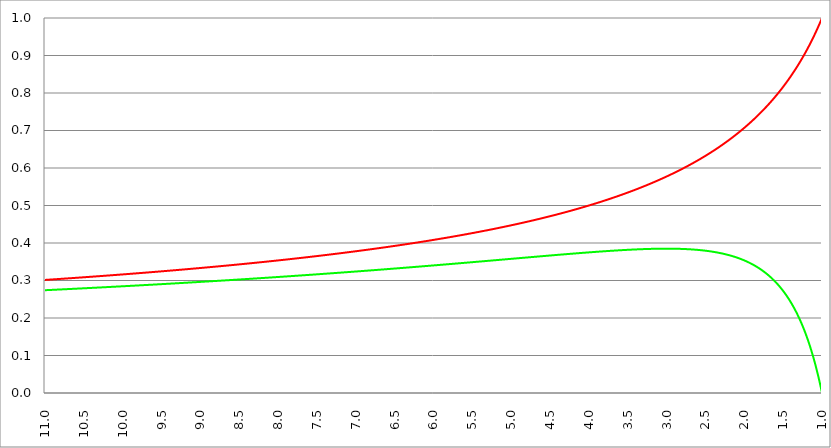
| Category | Series 1 | Series 0 | Series 2 |
|---|---|---|---|
| 11.0 | 0.302 | 0.274 |  |
| 10.995 | 0.302 | 0.274 |  |
| 10.99 | 0.302 | 0.274 |  |
| 10.985 | 0.302 | 0.274 |  |
| 10.98 | 0.302 | 0.274 |  |
| 10.975 | 0.302 | 0.274 |  |
| 10.97 | 0.302 | 0.274 |  |
| 10.96499999999999 | 0.302 | 0.274 |  |
| 10.96 | 0.302 | 0.275 |  |
| 10.955 | 0.302 | 0.275 |  |
| 10.95 | 0.302 | 0.275 |  |
| 10.945 | 0.302 | 0.275 |  |
| 10.94 | 0.302 | 0.275 |  |
| 10.93499999999999 | 0.302 | 0.275 |  |
| 10.92999999999999 | 0.302 | 0.275 |  |
| 10.92499999999999 | 0.303 | 0.275 |  |
| 10.91999999999999 | 0.303 | 0.275 |  |
| 10.91499999999999 | 0.303 | 0.275 |  |
| 10.90999999999999 | 0.303 | 0.275 |  |
| 10.90499999999999 | 0.303 | 0.275 |  |
| 10.89999999999998 | 0.303 | 0.275 |  |
| 10.89499999999998 | 0.303 | 0.275 |  |
| 10.88999999999998 | 0.303 | 0.275 |  |
| 10.88499999999998 | 0.303 | 0.275 |  |
| 10.87999999999998 | 0.303 | 0.275 |  |
| 10.87499999999998 | 0.303 | 0.275 |  |
| 10.86999999999998 | 0.303 | 0.275 |  |
| 10.86499999999998 | 0.303 | 0.275 |  |
| 10.85999999999998 | 0.303 | 0.276 |  |
| 10.85499999999998 | 0.304 | 0.276 |  |
| 10.84999999999998 | 0.304 | 0.276 |  |
| 10.84499999999998 | 0.304 | 0.276 |  |
| 10.83999999999997 | 0.304 | 0.276 |  |
| 10.83499999999997 | 0.304 | 0.276 |  |
| 10.82999999999997 | 0.304 | 0.276 |  |
| 10.82499999999997 | 0.304 | 0.276 |  |
| 10.81999999999997 | 0.304 | 0.276 |  |
| 10.81499999999997 | 0.304 | 0.276 |  |
| 10.80999999999997 | 0.304 | 0.276 |  |
| 10.80499999999997 | 0.304 | 0.276 |  |
| 10.79999999999997 | 0.304 | 0.276 |  |
| 10.79499999999997 | 0.304 | 0.276 |  |
| 10.78999999999997 | 0.304 | 0.276 |  |
| 10.78499999999997 | 0.305 | 0.276 |  |
| 10.77999999999997 | 0.305 | 0.276 |  |
| 10.77499999999996 | 0.305 | 0.276 |  |
| 10.76999999999996 | 0.305 | 0.276 |  |
| 10.76499999999996 | 0.305 | 0.276 |  |
| 10.75999999999996 | 0.305 | 0.277 |  |
| 10.75499999999996 | 0.305 | 0.277 |  |
| 10.74999999999996 | 0.305 | 0.277 |  |
| 10.74499999999996 | 0.305 | 0.277 |  |
| 10.73999999999996 | 0.305 | 0.277 |  |
| 10.73499999999996 | 0.305 | 0.277 |  |
| 10.72999999999996 | 0.305 | 0.277 |  |
| 10.72499999999996 | 0.305 | 0.277 |  |
| 10.71999999999996 | 0.305 | 0.277 |  |
| 10.71499999999996 | 0.305 | 0.277 |  |
| 10.70999999999995 | 0.306 | 0.277 |  |
| 10.70499999999995 | 0.306 | 0.277 |  |
| 10.69999999999995 | 0.306 | 0.277 |  |
| 10.69499999999995 | 0.306 | 0.277 |  |
| 10.68999999999995 | 0.306 | 0.277 |  |
| 10.68499999999995 | 0.306 | 0.277 |  |
| 10.67999999999995 | 0.306 | 0.277 |  |
| 10.67499999999995 | 0.306 | 0.277 |  |
| 10.66999999999995 | 0.306 | 0.277 |  |
| 10.66499999999995 | 0.306 | 0.277 |  |
| 10.65999999999995 | 0.306 | 0.278 |  |
| 10.65499999999995 | 0.306 | 0.278 |  |
| 10.64999999999995 | 0.306 | 0.278 |  |
| 10.64499999999994 | 0.306 | 0.278 |  |
| 10.63999999999994 | 0.307 | 0.278 |  |
| 10.63499999999994 | 0.307 | 0.278 |  |
| 10.62999999999994 | 0.307 | 0.278 |  |
| 10.62499999999994 | 0.307 | 0.278 |  |
| 10.61999999999994 | 0.307 | 0.278 |  |
| 10.61499999999994 | 0.307 | 0.278 |  |
| 10.60999999999994 | 0.307 | 0.278 |  |
| 10.60499999999994 | 0.307 | 0.278 |  |
| 10.59999999999994 | 0.307 | 0.278 |  |
| 10.59499999999994 | 0.307 | 0.278 |  |
| 10.58999999999994 | 0.307 | 0.278 |  |
| 10.58499999999994 | 0.307 | 0.278 |  |
| 10.57999999999993 | 0.307 | 0.278 |  |
| 10.57499999999993 | 0.308 | 0.278 |  |
| 10.56999999999993 | 0.308 | 0.278 |  |
| 10.56499999999993 | 0.308 | 0.279 |  |
| 10.55999999999993 | 0.308 | 0.279 |  |
| 10.55499999999993 | 0.308 | 0.279 |  |
| 10.54999999999993 | 0.308 | 0.279 |  |
| 10.54499999999993 | 0.308 | 0.279 |  |
| 10.53999999999993 | 0.308 | 0.279 |  |
| 10.53499999999993 | 0.308 | 0.279 |  |
| 10.52999999999993 | 0.308 | 0.279 |  |
| 10.52499999999993 | 0.308 | 0.279 |  |
| 10.51999999999992 | 0.308 | 0.279 |  |
| 10.51499999999992 | 0.308 | 0.279 |  |
| 10.50999999999992 | 0.308 | 0.279 |  |
| 10.50499999999992 | 0.309 | 0.279 |  |
| 10.49999999999992 | 0.309 | 0.279 |  |
| 10.49499999999992 | 0.309 | 0.279 |  |
| 10.48999999999992 | 0.309 | 0.279 |  |
| 10.48499999999992 | 0.309 | 0.279 |  |
| 10.47999999999992 | 0.309 | 0.279 |  |
| 10.47499999999992 | 0.309 | 0.279 |  |
| 10.46999999999992 | 0.309 | 0.28 |  |
| 10.46499999999992 | 0.309 | 0.28 |  |
| 10.45999999999992 | 0.309 | 0.28 |  |
| 10.45499999999991 | 0.309 | 0.28 |  |
| 10.44999999999991 | 0.309 | 0.28 |  |
| 10.44499999999991 | 0.309 | 0.28 |  |
| 10.43999999999991 | 0.309 | 0.28 |  |
| 10.43499999999991 | 0.31 | 0.28 |  |
| 10.42999999999991 | 0.31 | 0.28 |  |
| 10.42499999999991 | 0.31 | 0.28 |  |
| 10.41999999999991 | 0.31 | 0.28 |  |
| 10.41499999999991 | 0.31 | 0.28 |  |
| 10.40999999999991 | 0.31 | 0.28 |  |
| 10.40499999999991 | 0.31 | 0.28 |  |
| 10.39999999999991 | 0.31 | 0.28 |  |
| 10.39499999999991 | 0.31 | 0.28 |  |
| 10.3899999999999 | 0.31 | 0.28 |  |
| 10.3849999999999 | 0.31 | 0.28 |  |
| 10.3799999999999 | 0.31 | 0.28 |  |
| 10.3749999999999 | 0.31 | 0.281 |  |
| 10.3699999999999 | 0.311 | 0.281 |  |
| 10.3649999999999 | 0.311 | 0.281 |  |
| 10.3599999999999 | 0.311 | 0.281 |  |
| 10.3549999999999 | 0.311 | 0.281 |  |
| 10.3499999999999 | 0.311 | 0.281 |  |
| 10.3449999999999 | 0.311 | 0.281 |  |
| 10.3399999999999 | 0.311 | 0.281 |  |
| 10.3349999999999 | 0.311 | 0.281 |  |
| 10.3299999999999 | 0.311 | 0.281 |  |
| 10.32499999999989 | 0.311 | 0.281 |  |
| 10.31999999999989 | 0.311 | 0.281 |  |
| 10.31499999999989 | 0.311 | 0.281 |  |
| 10.3099999999999 | 0.311 | 0.281 |  |
| 10.3049999999999 | 0.312 | 0.281 |  |
| 10.2999999999999 | 0.312 | 0.281 |  |
| 10.29499999999989 | 0.312 | 0.281 |  |
| 10.28999999999989 | 0.312 | 0.281 |  |
| 10.28499999999989 | 0.312 | 0.281 |  |
| 10.27999999999989 | 0.312 | 0.282 |  |
| 10.27499999999989 | 0.312 | 0.282 |  |
| 10.26999999999989 | 0.312 | 0.282 |  |
| 10.26499999999989 | 0.312 | 0.282 |  |
| 10.25999999999988 | 0.312 | 0.282 |  |
| 10.25499999999988 | 0.312 | 0.282 |  |
| 10.24999999999988 | 0.312 | 0.282 |  |
| 10.24499999999988 | 0.312 | 0.282 |  |
| 10.23999999999988 | 0.313 | 0.282 |  |
| 10.23499999999988 | 0.313 | 0.282 |  |
| 10.22999999999988 | 0.313 | 0.282 |  |
| 10.22499999999988 | 0.313 | 0.282 |  |
| 10.21999999999988 | 0.313 | 0.282 |  |
| 10.21499999999988 | 0.313 | 0.282 |  |
| 10.20999999999988 | 0.313 | 0.282 |  |
| 10.20499999999988 | 0.313 | 0.282 |  |
| 10.19999999999987 | 0.313 | 0.282 |  |
| 10.19499999999987 | 0.313 | 0.282 |  |
| 10.18999999999987 | 0.313 | 0.283 |  |
| 10.18499999999987 | 0.313 | 0.283 |  |
| 10.17999999999987 | 0.313 | 0.283 |  |
| 10.17499999999987 | 0.313 | 0.283 |  |
| 10.16999999999987 | 0.314 | 0.283 |  |
| 10.16499999999987 | 0.314 | 0.283 |  |
| 10.15999999999987 | 0.314 | 0.283 |  |
| 10.15499999999987 | 0.314 | 0.283 |  |
| 10.14999999999987 | 0.314 | 0.283 |  |
| 10.14499999999987 | 0.314 | 0.283 |  |
| 10.13999999999987 | 0.314 | 0.283 |  |
| 10.13499999999986 | 0.314 | 0.283 |  |
| 10.12999999999986 | 0.314 | 0.283 |  |
| 10.12499999999986 | 0.314 | 0.283 |  |
| 10.11999999999986 | 0.314 | 0.283 |  |
| 10.11499999999986 | 0.314 | 0.283 |  |
| 10.10999999999986 | 0.315 | 0.283 |  |
| 10.10499999999986 | 0.315 | 0.283 |  |
| 10.09999999999986 | 0.315 | 0.284 |  |
| 10.09499999999986 | 0.315 | 0.284 |  |
| 10.08999999999986 | 0.315 | 0.284 |  |
| 10.08499999999986 | 0.315 | 0.284 |  |
| 10.07999999999986 | 0.315 | 0.284 |  |
| 10.07499999999986 | 0.315 | 0.284 |  |
| 10.06999999999985 | 0.315 | 0.284 |  |
| 10.06499999999985 | 0.315 | 0.284 |  |
| 10.05999999999985 | 0.315 | 0.284 |  |
| 10.05499999999985 | 0.315 | 0.284 |  |
| 10.04999999999985 | 0.315 | 0.284 |  |
| 10.04499999999985 | 0.316 | 0.284 |  |
| 10.03999999999985 | 0.316 | 0.284 |  |
| 10.03499999999985 | 0.316 | 0.284 |  |
| 10.02999999999985 | 0.316 | 0.284 |  |
| 10.02499999999985 | 0.316 | 0.284 |  |
| 10.01999999999985 | 0.316 | 0.284 |  |
| 10.01499999999985 | 0.316 | 0.284 |  |
| 10.00999999999985 | 0.316 | 0.284 |  |
| 10.00499999999984 | 0.316 | 0.285 |  |
| 9.999999999999844 | 0.316 | 0.285 |  |
| 9.994999999999841 | 0.316 | 0.285 |  |
| 9.98999999999984 | 0.316 | 0.285 |  |
| 9.98499999999984 | 0.316 | 0.285 |  |
| 9.97999999999984 | 0.317 | 0.285 |  |
| 9.97499999999984 | 0.317 | 0.285 |  |
| 9.969999999999837 | 0.317 | 0.285 |  |
| 9.964999999999838 | 0.317 | 0.285 |  |
| 9.959999999999837 | 0.317 | 0.285 |  |
| 9.954999999999837 | 0.317 | 0.285 |  |
| 9.949999999999836 | 0.317 | 0.285 |  |
| 9.944999999999835 | 0.317 | 0.285 |  |
| 9.939999999999834 | 0.317 | 0.285 |  |
| 9.934999999999834 | 0.317 | 0.285 |  |
| 9.929999999999833 | 0.317 | 0.285 |  |
| 9.92499999999983 | 0.317 | 0.285 |  |
| 9.91999999999983 | 0.318 | 0.285 |  |
| 9.91499999999983 | 0.318 | 0.286 |  |
| 9.90999999999983 | 0.318 | 0.286 |  |
| 9.904999999999829 | 0.318 | 0.286 |  |
| 9.899999999999826 | 0.318 | 0.286 |  |
| 9.894999999999827 | 0.318 | 0.286 |  |
| 9.889999999999826 | 0.318 | 0.286 |  |
| 9.884999999999826 | 0.318 | 0.286 |  |
| 9.879999999999823 | 0.318 | 0.286 |  |
| 9.874999999999824 | 0.318 | 0.286 |  |
| 9.869999999999823 | 0.318 | 0.286 |  |
| 9.864999999999823 | 0.318 | 0.286 |  |
| 9.85999999999982 | 0.318 | 0.286 |  |
| 9.85499999999982 | 0.319 | 0.286 |  |
| 9.84999999999982 | 0.319 | 0.286 |  |
| 9.84499999999982 | 0.319 | 0.286 |  |
| 9.839999999999819 | 0.319 | 0.286 |  |
| 9.834999999999818 | 0.319 | 0.286 |  |
| 9.829999999999817 | 0.319 | 0.287 |  |
| 9.824999999999816 | 0.319 | 0.287 |  |
| 9.819999999999816 | 0.319 | 0.287 |  |
| 9.814999999999815 | 0.319 | 0.287 |  |
| 9.809999999999812 | 0.319 | 0.287 |  |
| 9.804999999999813 | 0.319 | 0.287 |  |
| 9.799999999999812 | 0.319 | 0.287 |  |
| 9.794999999999812 | 0.32 | 0.287 |  |
| 9.78999999999981 | 0.32 | 0.287 |  |
| 9.78499999999981 | 0.32 | 0.287 |  |
| 9.77999999999981 | 0.32 | 0.287 |  |
| 9.774999999999809 | 0.32 | 0.287 |  |
| 9.769999999999808 | 0.32 | 0.287 |  |
| 9.764999999999807 | 0.32 | 0.287 |  |
| 9.759999999999806 | 0.32 | 0.287 |  |
| 9.754999999999805 | 0.32 | 0.287 |  |
| 9.749999999999805 | 0.32 | 0.287 |  |
| 9.744999999999804 | 0.32 | 0.287 |  |
| 9.739999999999803 | 0.32 | 0.288 |  |
| 9.734999999999802 | 0.321 | 0.288 |  |
| 9.729999999999801 | 0.321 | 0.288 |  |
| 9.7249999999998 | 0.321 | 0.288 |  |
| 9.7199999999998 | 0.321 | 0.288 |  |
| 9.7149999999998 | 0.321 | 0.288 |  |
| 9.709999999999798 | 0.321 | 0.288 |  |
| 9.704999999999798 | 0.321 | 0.288 |  |
| 9.699999999999797 | 0.321 | 0.288 |  |
| 9.694999999999794 | 0.321 | 0.288 |  |
| 9.689999999999795 | 0.321 | 0.288 |  |
| 9.684999999999794 | 0.321 | 0.288 |  |
| 9.679999999999794 | 0.321 | 0.288 |  |
| 9.674999999999793 | 0.321 | 0.288 |  |
| 9.66999999999979 | 0.322 | 0.288 |  |
| 9.66499999999979 | 0.322 | 0.288 |  |
| 9.65999999999979 | 0.322 | 0.288 |  |
| 9.65499999999979 | 0.322 | 0.288 |  |
| 9.649999999999787 | 0.322 | 0.289 |  |
| 9.644999999999788 | 0.322 | 0.289 |  |
| 9.639999999999787 | 0.322 | 0.289 |  |
| 9.634999999999787 | 0.322 | 0.289 |  |
| 9.629999999999786 | 0.322 | 0.289 |  |
| 9.624999999999785 | 0.322 | 0.289 |  |
| 9.619999999999784 | 0.322 | 0.289 |  |
| 9.614999999999783 | 0.322 | 0.289 |  |
| 9.609999999999783 | 0.323 | 0.289 |  |
| 9.60499999999978 | 0.323 | 0.289 |  |
| 9.59999999999978 | 0.323 | 0.289 |  |
| 9.59499999999978 | 0.323 | 0.289 |  |
| 9.58999999999978 | 0.323 | 0.289 |  |
| 9.584999999999779 | 0.323 | 0.289 |  |
| 9.579999999999778 | 0.323 | 0.289 |  |
| 9.574999999999777 | 0.323 | 0.289 |  |
| 9.569999999999776 | 0.323 | 0.289 |  |
| 9.564999999999776 | 0.323 | 0.29 |  |
| 9.559999999999773 | 0.323 | 0.29 |  |
| 9.554999999999774 | 0.324 | 0.29 |  |
| 9.549999999999773 | 0.324 | 0.29 |  |
| 9.544999999999773 | 0.324 | 0.29 |  |
| 9.539999999999772 | 0.324 | 0.29 |  |
| 9.534999999999771 | 0.324 | 0.29 |  |
| 9.52999999999977 | 0.324 | 0.29 |  |
| 9.52499999999977 | 0.324 | 0.29 |  |
| 9.519999999999769 | 0.324 | 0.29 |  |
| 9.514999999999768 | 0.324 | 0.29 |  |
| 9.509999999999767 | 0.324 | 0.29 |  |
| 9.504999999999766 | 0.324 | 0.29 |  |
| 9.499999999999766 | 0.324 | 0.29 |  |
| 9.494999999999765 | 0.325 | 0.29 |  |
| 9.489999999999762 | 0.325 | 0.29 |  |
| 9.484999999999763 | 0.325 | 0.29 |  |
| 9.47999999999976 | 0.325 | 0.291 |  |
| 9.47499999999976 | 0.325 | 0.291 |  |
| 9.46999999999976 | 0.325 | 0.291 |  |
| 9.46499999999976 | 0.325 | 0.291 |  |
| 9.45999999999976 | 0.325 | 0.291 |  |
| 9.454999999999758 | 0.325 | 0.291 |  |
| 9.449999999999758 | 0.325 | 0.291 |  |
| 9.444999999999757 | 0.325 | 0.291 |  |
| 9.439999999999756 | 0.325 | 0.291 |  |
| 9.434999999999755 | 0.326 | 0.291 |  |
| 9.429999999999755 | 0.326 | 0.291 |  |
| 9.424999999999754 | 0.326 | 0.291 |  |
| 9.419999999999751 | 0.326 | 0.291 |  |
| 9.414999999999752 | 0.326 | 0.291 |  |
| 9.40999999999975 | 0.326 | 0.291 |  |
| 9.40499999999975 | 0.326 | 0.291 |  |
| 9.39999999999975 | 0.326 | 0.291 |  |
| 9.39499999999975 | 0.326 | 0.292 |  |
| 9.389999999999748 | 0.326 | 0.292 |  |
| 9.384999999999748 | 0.326 | 0.292 |  |
| 9.379999999999747 | 0.327 | 0.292 |  |
| 9.374999999999744 | 0.327 | 0.292 |  |
| 9.369999999999745 | 0.327 | 0.292 |  |
| 9.364999999999744 | 0.327 | 0.292 |  |
| 9.35999999999974 | 0.327 | 0.292 |  |
| 9.35499999999974 | 0.327 | 0.292 |  |
| 9.34999999999974 | 0.327 | 0.292 |  |
| 9.34499999999974 | 0.327 | 0.292 |  |
| 9.33999999999974 | 0.327 | 0.292 |  |
| 9.33499999999974 | 0.327 | 0.292 |  |
| 9.329999999999737 | 0.327 | 0.292 |  |
| 9.324999999999738 | 0.327 | 0.292 |  |
| 9.319999999999737 | 0.328 | 0.292 |  |
| 9.314999999999737 | 0.328 | 0.292 |  |
| 9.309999999999736 | 0.328 | 0.293 |  |
| 9.304999999999733 | 0.328 | 0.293 |  |
| 9.299999999999734 | 0.328 | 0.293 |  |
| 9.294999999999733 | 0.328 | 0.293 |  |
| 9.289999999999733 | 0.328 | 0.293 |  |
| 9.28499999999973 | 0.328 | 0.293 |  |
| 9.27999999999973 | 0.328 | 0.293 |  |
| 9.27499999999973 | 0.328 | 0.293 |  |
| 9.26999999999973 | 0.328 | 0.293 |  |
| 9.264999999999729 | 0.329 | 0.293 |  |
| 9.259999999999726 | 0.329 | 0.293 |  |
| 9.254999999999727 | 0.329 | 0.293 |  |
| 9.249999999999726 | 0.329 | 0.293 |  |
| 9.244999999999726 | 0.329 | 0.293 |  |
| 9.239999999999725 | 0.329 | 0.293 |  |
| 9.234999999999724 | 0.329 | 0.293 |  |
| 9.229999999999723 | 0.329 | 0.293 |  |
| 9.224999999999723 | 0.329 | 0.294 |  |
| 9.219999999999722 | 0.329 | 0.294 |  |
| 9.214999999999721 | 0.329 | 0.294 |  |
| 9.20999999999972 | 0.33 | 0.294 |  |
| 9.20499999999972 | 0.33 | 0.294 |  |
| 9.199999999999719 | 0.33 | 0.294 |  |
| 9.194999999999718 | 0.33 | 0.294 |  |
| 9.189999999999717 | 0.33 | 0.294 |  |
| 9.184999999999716 | 0.33 | 0.294 |  |
| 9.179999999999715 | 0.33 | 0.294 |  |
| 9.174999999999715 | 0.33 | 0.294 |  |
| 9.169999999999712 | 0.33 | 0.294 |  |
| 9.164999999999713 | 0.33 | 0.294 |  |
| 9.15999999999971 | 0.33 | 0.294 |  |
| 9.15499999999971 | 0.33 | 0.294 |  |
| 9.14999999999971 | 0.331 | 0.294 |  |
| 9.14499999999971 | 0.331 | 0.295 |  |
| 9.13999999999971 | 0.331 | 0.295 |  |
| 9.134999999999708 | 0.331 | 0.295 |  |
| 9.129999999999708 | 0.331 | 0.295 |  |
| 9.124999999999707 | 0.331 | 0.295 |  |
| 9.119999999999706 | 0.331 | 0.295 |  |
| 9.114999999999705 | 0.331 | 0.295 |  |
| 9.109999999999705 | 0.331 | 0.295 |  |
| 9.104999999999704 | 0.331 | 0.295 |  |
| 9.099999999999701 | 0.331 | 0.295 |  |
| 9.094999999999702 | 0.332 | 0.295 |  |
| 9.0899999999997 | 0.332 | 0.295 |  |
| 9.0849999999997 | 0.332 | 0.295 |  |
| 9.0799999999997 | 0.332 | 0.295 |  |
| 9.0749999999997 | 0.332 | 0.295 |  |
| 9.069999999999698 | 0.332 | 0.295 |  |
| 9.064999999999698 | 0.332 | 0.295 |  |
| 9.059999999999697 | 0.332 | 0.296 |  |
| 9.054999999999694 | 0.332 | 0.296 |  |
| 9.049999999999695 | 0.332 | 0.296 |  |
| 9.044999999999694 | 0.333 | 0.296 |  |
| 9.039999999999694 | 0.333 | 0.296 |  |
| 9.034999999999693 | 0.333 | 0.296 |  |
| 9.02999999999969 | 0.333 | 0.296 |  |
| 9.02499999999969 | 0.333 | 0.296 |  |
| 9.01999999999969 | 0.333 | 0.296 |  |
| 9.01499999999969 | 0.333 | 0.296 |  |
| 9.009999999999687 | 0.333 | 0.296 |  |
| 9.004999999999688 | 0.333 | 0.296 |  |
| 8.999999999999687 | 0.333 | 0.296 |  |
| 8.994999999999687 | 0.333 | 0.296 |  |
| 8.989999999999686 | 0.334 | 0.296 |  |
| 8.984999999999683 | 0.334 | 0.296 |  |
| 8.979999999999684 | 0.334 | 0.297 |  |
| 8.974999999999683 | 0.334 | 0.297 |  |
| 8.96999999999968 | 0.334 | 0.297 |  |
| 8.96499999999968 | 0.334 | 0.297 |  |
| 8.95999999999968 | 0.334 | 0.297 |  |
| 8.95499999999968 | 0.334 | 0.297 |  |
| 8.94999999999968 | 0.334 | 0.297 |  |
| 8.944999999999679 | 0.334 | 0.297 |  |
| 8.939999999999676 | 0.334 | 0.297 |  |
| 8.934999999999677 | 0.335 | 0.297 |  |
| 8.929999999999676 | 0.335 | 0.297 |  |
| 8.924999999999676 | 0.335 | 0.297 |  |
| 8.919999999999675 | 0.335 | 0.297 |  |
| 8.914999999999674 | 0.335 | 0.297 |  |
| 8.909999999999673 | 0.335 | 0.297 |  |
| 8.904999999999673 | 0.335 | 0.297 |  |
| 8.89999999999967 | 0.335 | 0.298 |  |
| 8.89499999999967 | 0.335 | 0.298 |  |
| 8.88999999999967 | 0.335 | 0.298 |  |
| 8.88499999999967 | 0.335 | 0.298 |  |
| 8.879999999999669 | 0.336 | 0.298 |  |
| 8.874999999999668 | 0.336 | 0.298 |  |
| 8.869999999999665 | 0.336 | 0.298 |  |
| 8.864999999999666 | 0.336 | 0.298 |  |
| 8.859999999999665 | 0.336 | 0.298 |  |
| 8.854999999999665 | 0.336 | 0.298 |  |
| 8.849999999999662 | 0.336 | 0.298 |  |
| 8.844999999999663 | 0.336 | 0.298 |  |
| 8.83999999999966 | 0.336 | 0.298 |  |
| 8.83499999999966 | 0.336 | 0.298 |  |
| 8.82999999999966 | 0.337 | 0.298 |  |
| 8.82499999999966 | 0.337 | 0.298 |  |
| 8.81999999999966 | 0.337 | 0.299 |  |
| 8.814999999999658 | 0.337 | 0.299 |  |
| 8.809999999999658 | 0.337 | 0.299 |  |
| 8.804999999999657 | 0.337 | 0.299 |  |
| 8.799999999999656 | 0.337 | 0.299 |  |
| 8.794999999999655 | 0.337 | 0.299 |  |
| 8.789999999999655 | 0.337 | 0.299 |  |
| 8.784999999999654 | 0.337 | 0.299 |  |
| 8.779999999999651 | 0.337 | 0.299 |  |
| 8.774999999999652 | 0.338 | 0.299 |  |
| 8.76999999999965 | 0.338 | 0.299 |  |
| 8.76499999999965 | 0.338 | 0.299 |  |
| 8.75999999999965 | 0.338 | 0.299 |  |
| 8.754999999999647 | 0.338 | 0.299 |  |
| 8.749999999999648 | 0.338 | 0.299 |  |
| 8.744999999999647 | 0.338 | 0.299 |  |
| 8.739999999999647 | 0.338 | 0.3 |  |
| 8.734999999999644 | 0.338 | 0.3 |  |
| 8.729999999999645 | 0.338 | 0.3 |  |
| 8.724999999999644 | 0.339 | 0.3 |  |
| 8.719999999999644 | 0.339 | 0.3 |  |
| 8.714999999999643 | 0.339 | 0.3 |  |
| 8.70999999999964 | 0.339 | 0.3 |  |
| 8.70499999999964 | 0.339 | 0.3 |  |
| 8.69999999999964 | 0.339 | 0.3 |  |
| 8.69499999999964 | 0.339 | 0.3 |  |
| 8.689999999999637 | 0.339 | 0.3 |  |
| 8.684999999999638 | 0.339 | 0.3 |  |
| 8.679999999999637 | 0.339 | 0.3 |  |
| 8.674999999999637 | 0.34 | 0.3 |  |
| 8.669999999999636 | 0.34 | 0.3 |  |
| 8.664999999999633 | 0.34 | 0.301 |  |
| 8.659999999999634 | 0.34 | 0.301 |  |
| 8.654999999999633 | 0.34 | 0.301 |  |
| 8.649999999999633 | 0.34 | 0.301 |  |
| 8.644999999999632 | 0.34 | 0.301 |  |
| 8.63999999999963 | 0.34 | 0.301 |  |
| 8.63499999999963 | 0.34 | 0.301 |  |
| 8.62999999999963 | 0.34 | 0.301 |  |
| 8.624999999999629 | 0.341 | 0.301 |  |
| 8.619999999999626 | 0.341 | 0.301 |  |
| 8.614999999999627 | 0.341 | 0.301 |  |
| 8.609999999999626 | 0.341 | 0.301 |  |
| 8.604999999999626 | 0.341 | 0.301 |  |
| 8.599999999999625 | 0.341 | 0.301 |  |
| 8.594999999999624 | 0.341 | 0.301 |  |
| 8.589999999999623 | 0.341 | 0.301 |  |
| 8.584999999999622 | 0.341 | 0.302 |  |
| 8.57999999999962 | 0.341 | 0.302 |  |
| 8.57499999999962 | 0.341 | 0.302 |  |
| 8.56999999999962 | 0.342 | 0.302 |  |
| 8.56499999999962 | 0.342 | 0.302 |  |
| 8.559999999999619 | 0.342 | 0.302 |  |
| 8.554999999999618 | 0.342 | 0.302 |  |
| 8.549999999999617 | 0.342 | 0.302 |  |
| 8.544999999999616 | 0.342 | 0.302 |  |
| 8.539999999999615 | 0.342 | 0.302 |  |
| 8.534999999999615 | 0.342 | 0.302 |  |
| 8.529999999999612 | 0.342 | 0.302 |  |
| 8.524999999999613 | 0.342 | 0.302 |  |
| 8.51999999999961 | 0.343 | 0.302 |  |
| 8.51499999999961 | 0.343 | 0.302 |  |
| 8.50999999999961 | 0.343 | 0.303 |  |
| 8.50499999999961 | 0.343 | 0.303 |  |
| 8.49999999999961 | 0.343 | 0.303 |  |
| 8.494999999999608 | 0.343 | 0.303 |  |
| 8.489999999999608 | 0.343 | 0.303 |  |
| 8.484999999999607 | 0.343 | 0.303 |  |
| 8.479999999999606 | 0.343 | 0.303 |  |
| 8.474999999999605 | 0.344 | 0.303 |  |
| 8.469999999999605 | 0.344 | 0.303 |  |
| 8.464999999999604 | 0.344 | 0.303 |  |
| 8.4599999999996 | 0.344 | 0.303 |  |
| 8.4549999999996 | 0.344 | 0.303 |  |
| 8.4499999999996 | 0.344 | 0.303 |  |
| 8.4449999999996 | 0.344 | 0.303 |  |
| 8.4399999999996 | 0.344 | 0.303 |  |
| 8.4349999999996 | 0.344 | 0.303 |  |
| 8.429999999999598 | 0.344 | 0.304 |  |
| 8.424999999999597 | 0.345 | 0.304 |  |
| 8.419999999999597 | 0.345 | 0.304 |  |
| 8.414999999999594 | 0.345 | 0.304 |  |
| 8.409999999999595 | 0.345 | 0.304 |  |
| 8.404999999999594 | 0.345 | 0.304 |  |
| 8.399999999999594 | 0.345 | 0.304 |  |
| 8.394999999999593 | 0.345 | 0.304 |  |
| 8.38999999999959 | 0.345 | 0.304 |  |
| 8.38499999999959 | 0.345 | 0.304 |  |
| 8.37999999999959 | 0.345 | 0.304 |  |
| 8.37499999999959 | 0.346 | 0.304 |  |
| 8.369999999999589 | 0.346 | 0.304 |  |
| 8.364999999999588 | 0.346 | 0.304 |  |
| 8.359999999999587 | 0.346 | 0.304 |  |
| 8.354999999999587 | 0.346 | 0.305 |  |
| 8.349999999999586 | 0.346 | 0.305 |  |
| 8.344999999999585 | 0.346 | 0.305 |  |
| 8.339999999999584 | 0.346 | 0.305 |  |
| 8.334999999999583 | 0.346 | 0.305 |  |
| 8.329999999999583 | 0.346 | 0.305 |  |
| 8.324999999999582 | 0.347 | 0.305 |  |
| 8.31999999999958 | 0.347 | 0.305 |  |
| 8.31499999999958 | 0.347 | 0.305 |  |
| 8.30999999999958 | 0.347 | 0.305 |  |
| 8.304999999999579 | 0.347 | 0.305 |  |
| 8.299999999999578 | 0.347 | 0.305 |  |
| 8.294999999999577 | 0.347 | 0.305 |  |
| 8.289999999999576 | 0.347 | 0.305 |  |
| 8.284999999999576 | 0.347 | 0.305 |  |
| 8.279999999999575 | 0.348 | 0.306 |  |
| 8.274999999999574 | 0.348 | 0.306 |  |
| 8.269999999999573 | 0.348 | 0.306 |  |
| 8.264999999999572 | 0.348 | 0.306 |  |
| 8.259999999999572 | 0.348 | 0.306 |  |
| 8.254999999999571 | 0.348 | 0.306 |  |
| 8.24999999999957 | 0.348 | 0.306 |  |
| 8.24499999999957 | 0.348 | 0.306 |  |
| 8.239999999999569 | 0.348 | 0.306 |  |
| 8.234999999999568 | 0.348 | 0.306 |  |
| 8.229999999999567 | 0.349 | 0.306 |  |
| 8.224999999999566 | 0.349 | 0.306 |  |
| 8.219999999999565 | 0.349 | 0.306 |  |
| 8.214999999999565 | 0.349 | 0.306 |  |
| 8.209999999999564 | 0.349 | 0.306 |  |
| 8.204999999999563 | 0.349 | 0.307 |  |
| 8.199999999999562 | 0.349 | 0.307 |  |
| 8.194999999999562 | 0.349 | 0.307 |  |
| 8.18999999999956 | 0.349 | 0.307 |  |
| 8.18499999999956 | 0.35 | 0.307 |  |
| 8.17999999999956 | 0.35 | 0.307 |  |
| 8.174999999999558 | 0.35 | 0.307 |  |
| 8.169999999999558 | 0.35 | 0.307 |  |
| 8.164999999999557 | 0.35 | 0.307 |  |
| 8.159999999999556 | 0.35 | 0.307 |  |
| 8.154999999999555 | 0.35 | 0.307 |  |
| 8.149999999999554 | 0.35 | 0.307 |  |
| 8.144999999999554 | 0.35 | 0.307 |  |
| 8.139999999999553 | 0.35 | 0.307 |  |
| 8.134999999999552 | 0.351 | 0.308 |  |
| 8.129999999999551 | 0.351 | 0.308 |  |
| 8.12499999999955 | 0.351 | 0.308 |  |
| 8.11999999999955 | 0.351 | 0.308 |  |
| 8.11499999999955 | 0.351 | 0.308 |  |
| 8.109999999999548 | 0.351 | 0.308 |  |
| 8.104999999999547 | 0.351 | 0.308 |  |
| 8.099999999999547 | 0.351 | 0.308 |  |
| 8.094999999999544 | 0.351 | 0.308 |  |
| 8.089999999999545 | 0.352 | 0.308 |  |
| 8.084999999999544 | 0.352 | 0.308 |  |
| 8.079999999999544 | 0.352 | 0.308 |  |
| 8.074999999999543 | 0.352 | 0.308 |  |
| 8.06999999999954 | 0.352 | 0.308 |  |
| 8.06499999999954 | 0.352 | 0.308 |  |
| 8.05999999999954 | 0.352 | 0.309 |  |
| 8.05499999999954 | 0.352 | 0.309 |  |
| 8.049999999999539 | 0.352 | 0.309 |  |
| 8.044999999999538 | 0.353 | 0.309 |  |
| 8.039999999999537 | 0.353 | 0.309 |  |
| 8.034999999999537 | 0.353 | 0.309 |  |
| 8.029999999999536 | 0.353 | 0.309 |  |
| 8.024999999999535 | 0.353 | 0.309 |  |
| 8.019999999999534 | 0.353 | 0.309 |  |
| 8.014999999999533 | 0.353 | 0.309 |  |
| 8.009999999999533 | 0.353 | 0.309 |  |
| 8.004999999999532 | 0.353 | 0.309 |  |
| 7.999999999999531 | 0.354 | 0.309 |  |
| 7.994999999999532 | 0.354 | 0.309 |  |
| 7.989999999999532 | 0.354 | 0.309 |  |
| 7.984999999999532 | 0.354 | 0.31 |  |
| 7.979999999999532 | 0.354 | 0.31 |  |
| 7.974999999999532 | 0.354 | 0.31 |  |
| 7.969999999999532 | 0.354 | 0.31 |  |
| 7.964999999999533 | 0.354 | 0.31 |  |
| 7.959999999999532 | 0.354 | 0.31 |  |
| 7.954999999999533 | 0.355 | 0.31 |  |
| 7.949999999999532 | 0.355 | 0.31 |  |
| 7.944999999999533 | 0.355 | 0.31 |  |
| 7.939999999999533 | 0.355 | 0.31 |  |
| 7.934999999999533 | 0.355 | 0.31 |  |
| 7.929999999999533 | 0.355 | 0.31 |  |
| 7.924999999999534 | 0.355 | 0.31 |  |
| 7.919999999999533 | 0.355 | 0.31 |  |
| 7.914999999999534 | 0.355 | 0.311 |  |
| 7.909999999999533 | 0.356 | 0.311 |  |
| 7.904999999999534 | 0.356 | 0.311 |  |
| 7.899999999999534 | 0.356 | 0.311 |  |
| 7.894999999999534 | 0.356 | 0.311 |  |
| 7.889999999999534 | 0.356 | 0.311 |  |
| 7.884999999999534 | 0.356 | 0.311 |  |
| 7.879999999999534 | 0.356 | 0.311 |  |
| 7.874999999999534 | 0.356 | 0.311 |  |
| 7.869999999999534 | 0.356 | 0.311 |  |
| 7.864999999999535 | 0.357 | 0.311 |  |
| 7.859999999999534 | 0.357 | 0.311 |  |
| 7.854999999999535 | 0.357 | 0.311 |  |
| 7.849999999999535 | 0.357 | 0.311 |  |
| 7.844999999999535 | 0.357 | 0.312 |  |
| 7.839999999999535 | 0.357 | 0.312 |  |
| 7.834999999999535 | 0.357 | 0.312 |  |
| 7.829999999999535 | 0.357 | 0.312 |  |
| 7.824999999999536 | 0.357 | 0.312 |  |
| 7.819999999999535 | 0.358 | 0.312 |  |
| 7.814999999999536 | 0.358 | 0.312 |  |
| 7.809999999999535 | 0.358 | 0.312 |  |
| 7.804999999999536 | 0.358 | 0.312 |  |
| 7.799999999999536 | 0.358 | 0.312 |  |
| 7.794999999999536 | 0.358 | 0.312 |  |
| 7.789999999999536 | 0.358 | 0.312 |  |
| 7.784999999999536 | 0.358 | 0.312 |  |
| 7.779999999999536 | 0.359 | 0.312 |  |
| 7.774999999999536 | 0.359 | 0.313 |  |
| 7.769999999999536 | 0.359 | 0.313 |  |
| 7.764999999999537 | 0.359 | 0.313 |  |
| 7.759999999999536 | 0.359 | 0.313 |  |
| 7.754999999999537 | 0.359 | 0.313 |  |
| 7.749999999999537 | 0.359 | 0.313 |  |
| 7.744999999999537 | 0.359 | 0.313 |  |
| 7.739999999999537 | 0.359 | 0.313 |  |
| 7.734999999999537 | 0.36 | 0.313 |  |
| 7.729999999999537 | 0.36 | 0.313 |  |
| 7.724999999999538 | 0.36 | 0.313 |  |
| 7.719999999999537 | 0.36 | 0.313 |  |
| 7.714999999999538 | 0.36 | 0.313 |  |
| 7.709999999999538 | 0.36 | 0.313 |  |
| 7.704999999999538 | 0.36 | 0.314 |  |
| 7.699999999999538 | 0.36 | 0.314 |  |
| 7.694999999999538 | 0.36 | 0.314 |  |
| 7.689999999999538 | 0.361 | 0.314 |  |
| 7.684999999999539 | 0.361 | 0.314 |  |
| 7.679999999999538 | 0.361 | 0.314 |  |
| 7.674999999999539 | 0.361 | 0.314 |  |
| 7.669999999999539 | 0.361 | 0.314 |  |
| 7.664999999999539 | 0.361 | 0.314 |  |
| 7.65999999999954 | 0.361 | 0.314 |  |
| 7.654999999999539 | 0.361 | 0.314 |  |
| 7.64999999999954 | 0.362 | 0.314 |  |
| 7.644999999999539 | 0.362 | 0.314 |  |
| 7.63999999999954 | 0.362 | 0.314 |  |
| 7.63499999999954 | 0.362 | 0.315 |  |
| 7.62999999999954 | 0.362 | 0.315 |  |
| 7.62499999999954 | 0.362 | 0.315 |  |
| 7.61999999999954 | 0.362 | 0.315 |  |
| 7.61499999999954 | 0.362 | 0.315 |  |
| 7.60999999999954 | 0.362 | 0.315 |  |
| 7.60499999999954 | 0.363 | 0.315 |  |
| 7.59999999999954 | 0.363 | 0.315 |  |
| 7.594999999999541 | 0.363 | 0.315 |  |
| 7.58999999999954 | 0.363 | 0.315 |  |
| 7.584999999999541 | 0.363 | 0.315 |  |
| 7.57999999999954 | 0.363 | 0.315 |  |
| 7.574999999999541 | 0.363 | 0.315 |  |
| 7.569999999999541 | 0.363 | 0.315 |  |
| 7.564999999999541 | 0.364 | 0.316 |  |
| 7.559999999999541 | 0.364 | 0.316 |  |
| 7.554999999999541 | 0.364 | 0.316 |  |
| 7.549999999999541 | 0.364 | 0.316 |  |
| 7.544999999999542 | 0.364 | 0.316 |  |
| 7.539999999999541 | 0.364 | 0.316 |  |
| 7.534999999999542 | 0.364 | 0.316 |  |
| 7.529999999999542 | 0.364 | 0.316 |  |
| 7.524999999999542 | 0.365 | 0.316 |  |
| 7.519999999999542 | 0.365 | 0.316 |  |
| 7.514999999999542 | 0.365 | 0.316 |  |
| 7.509999999999542 | 0.365 | 0.316 |  |
| 7.504999999999542 | 0.365 | 0.316 |  |
| 7.499999999999542 | 0.365 | 0.316 |  |
| 7.494999999999543 | 0.365 | 0.317 |  |
| 7.489999999999542 | 0.365 | 0.317 |  |
| 7.484999999999543 | 0.366 | 0.317 |  |
| 7.479999999999542 | 0.366 | 0.317 |  |
| 7.474999999999543 | 0.366 | 0.317 |  |
| 7.469999999999543 | 0.366 | 0.317 |  |
| 7.464999999999543 | 0.366 | 0.317 |  |
| 7.459999999999543 | 0.366 | 0.317 |  |
| 7.454999999999544 | 0.366 | 0.317 |  |
| 7.449999999999543 | 0.366 | 0.317 |  |
| 7.444999999999544 | 0.366 | 0.317 |  |
| 7.439999999999543 | 0.367 | 0.317 |  |
| 7.434999999999544 | 0.367 | 0.317 |  |
| 7.429999999999544 | 0.367 | 0.317 |  |
| 7.424999999999544 | 0.367 | 0.318 |  |
| 7.419999999999544 | 0.367 | 0.318 |  |
| 7.414999999999544 | 0.367 | 0.318 |  |
| 7.409999999999544 | 0.367 | 0.318 |  |
| 7.404999999999544 | 0.367 | 0.318 |  |
| 7.399999999999544 | 0.368 | 0.318 |  |
| 7.394999999999545 | 0.368 | 0.318 |  |
| 7.389999999999544 | 0.368 | 0.318 |  |
| 7.384999999999545 | 0.368 | 0.318 |  |
| 7.379999999999545 | 0.368 | 0.318 |  |
| 7.374999999999545 | 0.368 | 0.318 |  |
| 7.369999999999545 | 0.368 | 0.318 |  |
| 7.364999999999545 | 0.368 | 0.318 |  |
| 7.359999999999545 | 0.369 | 0.319 |  |
| 7.354999999999546 | 0.369 | 0.319 |  |
| 7.349999999999545 | 0.369 | 0.319 |  |
| 7.344999999999546 | 0.369 | 0.319 |  |
| 7.339999999999545 | 0.369 | 0.319 |  |
| 7.334999999999546 | 0.369 | 0.319 |  |
| 7.329999999999546 | 0.369 | 0.319 |  |
| 7.324999999999546 | 0.369 | 0.319 |  |
| 7.319999999999546 | 0.37 | 0.319 |  |
| 7.314999999999546 | 0.37 | 0.319 |  |
| 7.309999999999546 | 0.37 | 0.319 |  |
| 7.304999999999547 | 0.37 | 0.319 |  |
| 7.299999999999546 | 0.37 | 0.319 |  |
| 7.294999999999547 | 0.37 | 0.319 |  |
| 7.289999999999547 | 0.37 | 0.32 |  |
| 7.284999999999547 | 0.37 | 0.32 |  |
| 7.279999999999547 | 0.371 | 0.32 |  |
| 7.274999999999547 | 0.371 | 0.32 |  |
| 7.269999999999547 | 0.371 | 0.32 |  |
| 7.264999999999548 | 0.371 | 0.32 |  |
| 7.259999999999547 | 0.371 | 0.32 |  |
| 7.254999999999548 | 0.371 | 0.32 |  |
| 7.249999999999547 | 0.371 | 0.32 |  |
| 7.244999999999548 | 0.372 | 0.32 |  |
| 7.239999999999548 | 0.372 | 0.32 |  |
| 7.234999999999548 | 0.372 | 0.32 |  |
| 7.229999999999548 | 0.372 | 0.32 |  |
| 7.224999999999548 | 0.372 | 0.321 |  |
| 7.219999999999548 | 0.372 | 0.321 |  |
| 7.214999999999549 | 0.372 | 0.321 |  |
| 7.209999999999548 | 0.372 | 0.321 |  |
| 7.204999999999549 | 0.373 | 0.321 |  |
| 7.199999999999549 | 0.373 | 0.321 |  |
| 7.194999999999549 | 0.373 | 0.321 |  |
| 7.18999999999955 | 0.373 | 0.321 |  |
| 7.184999999999549 | 0.373 | 0.321 |  |
| 7.17999999999955 | 0.373 | 0.321 |  |
| 7.17499999999955 | 0.373 | 0.321 |  |
| 7.16999999999955 | 0.373 | 0.321 |  |
| 7.16499999999955 | 0.374 | 0.321 |  |
| 7.15999999999955 | 0.374 | 0.322 |  |
| 7.15499999999955 | 0.374 | 0.322 |  |
| 7.14999999999955 | 0.374 | 0.322 |  |
| 7.14499999999955 | 0.374 | 0.322 |  |
| 7.13999999999955 | 0.374 | 0.322 |  |
| 7.13499999999955 | 0.374 | 0.322 |  |
| 7.12999999999955 | 0.375 | 0.322 |  |
| 7.124999999999551 | 0.375 | 0.322 |  |
| 7.119999999999551 | 0.375 | 0.322 |  |
| 7.114999999999551 | 0.375 | 0.322 |  |
| 7.109999999999551 | 0.375 | 0.322 |  |
| 7.104999999999551 | 0.375 | 0.322 |  |
| 7.099999999999551 | 0.375 | 0.322 |  |
| 7.094999999999551 | 0.375 | 0.323 |  |
| 7.089999999999551 | 0.376 | 0.323 |  |
| 7.084999999999551 | 0.376 | 0.323 |  |
| 7.079999999999551 | 0.376 | 0.323 |  |
| 7.074999999999552 | 0.376 | 0.323 |  |
| 7.069999999999552 | 0.376 | 0.323 |  |
| 7.064999999999552 | 0.376 | 0.323 |  |
| 7.059999999999552 | 0.376 | 0.323 |  |
| 7.054999999999552 | 0.376 | 0.323 |  |
| 7.049999999999552 | 0.377 | 0.323 |  |
| 7.044999999999552 | 0.377 | 0.323 |  |
| 7.039999999999552 | 0.377 | 0.323 |  |
| 7.034999999999552 | 0.377 | 0.323 |  |
| 7.029999999999553 | 0.377 | 0.324 |  |
| 7.024999999999553 | 0.377 | 0.324 |  |
| 7.019999999999553 | 0.377 | 0.324 |  |
| 7.014999999999553 | 0.378 | 0.324 |  |
| 7.009999999999553 | 0.378 | 0.324 |  |
| 7.004999999999553 | 0.378 | 0.324 |  |
| 6.999999999999553 | 0.378 | 0.324 |  |
| 6.994999999999553 | 0.378 | 0.324 |  |
| 6.989999999999553 | 0.378 | 0.324 |  |
| 6.984999999999554 | 0.378 | 0.324 |  |
| 6.979999999999553 | 0.379 | 0.324 |  |
| 6.974999999999554 | 0.379 | 0.324 |  |
| 6.969999999999554 | 0.379 | 0.324 |  |
| 6.964999999999554 | 0.379 | 0.325 |  |
| 6.959999999999554 | 0.379 | 0.325 |  |
| 6.954999999999554 | 0.379 | 0.325 |  |
| 6.949999999999554 | 0.379 | 0.325 |  |
| 6.944999999999554 | 0.379 | 0.325 |  |
| 6.939999999999554 | 0.38 | 0.325 |  |
| 6.934999999999554 | 0.38 | 0.325 |  |
| 6.929999999999554 | 0.38 | 0.325 |  |
| 6.924999999999555 | 0.38 | 0.325 |  |
| 6.919999999999554 | 0.38 | 0.325 |  |
| 6.914999999999555 | 0.38 | 0.325 |  |
| 6.909999999999555 | 0.38 | 0.325 |  |
| 6.904999999999555 | 0.381 | 0.325 |  |
| 6.899999999999555 | 0.381 | 0.326 |  |
| 6.894999999999555 | 0.381 | 0.326 |  |
| 6.889999999999555 | 0.381 | 0.326 |  |
| 6.884999999999556 | 0.381 | 0.326 |  |
| 6.879999999999555 | 0.381 | 0.326 |  |
| 6.874999999999556 | 0.381 | 0.326 |  |
| 6.869999999999556 | 0.382 | 0.326 |  |
| 6.864999999999556 | 0.382 | 0.326 |  |
| 6.859999999999556 | 0.382 | 0.326 |  |
| 6.854999999999556 | 0.382 | 0.326 |  |
| 6.849999999999556 | 0.382 | 0.326 |  |
| 6.844999999999556 | 0.382 | 0.326 |  |
| 6.839999999999556 | 0.382 | 0.326 |  |
| 6.834999999999557 | 0.382 | 0.327 |  |
| 6.829999999999557 | 0.383 | 0.327 |  |
| 6.824999999999557 | 0.383 | 0.327 |  |
| 6.819999999999557 | 0.383 | 0.327 |  |
| 6.814999999999557 | 0.383 | 0.327 |  |
| 6.809999999999557 | 0.383 | 0.327 |  |
| 6.804999999999557 | 0.383 | 0.327 |  |
| 6.799999999999557 | 0.383 | 0.327 |  |
| 6.794999999999558 | 0.384 | 0.327 |  |
| 6.789999999999557 | 0.384 | 0.327 |  |
| 6.784999999999558 | 0.384 | 0.327 |  |
| 6.779999999999557 | 0.384 | 0.327 |  |
| 6.774999999999558 | 0.384 | 0.327 |  |
| 6.769999999999558 | 0.384 | 0.328 |  |
| 6.764999999999558 | 0.384 | 0.328 |  |
| 6.759999999999558 | 0.385 | 0.328 |  |
| 6.754999999999558 | 0.385 | 0.328 |  |
| 6.749999999999558 | 0.385 | 0.328 |  |
| 6.744999999999559 | 0.385 | 0.328 |  |
| 6.739999999999558 | 0.385 | 0.328 |  |
| 6.734999999999559 | 0.385 | 0.328 |  |
| 6.729999999999559 | 0.385 | 0.328 |  |
| 6.724999999999559 | 0.386 | 0.328 |  |
| 6.71999999999956 | 0.386 | 0.328 |  |
| 6.714999999999559 | 0.386 | 0.328 |  |
| 6.70999999999956 | 0.386 | 0.329 |  |
| 6.704999999999559 | 0.386 | 0.329 |  |
| 6.69999999999956 | 0.386 | 0.329 |  |
| 6.69499999999956 | 0.386 | 0.329 |  |
| 6.68999999999956 | 0.387 | 0.329 |  |
| 6.68499999999956 | 0.387 | 0.329 |  |
| 6.67999999999956 | 0.387 | 0.329 |  |
| 6.67499999999956 | 0.387 | 0.329 |  |
| 6.66999999999956 | 0.387 | 0.329 |  |
| 6.66499999999956 | 0.387 | 0.329 |  |
| 6.65999999999956 | 0.387 | 0.329 |  |
| 6.654999999999561 | 0.388 | 0.329 |  |
| 6.64999999999956 | 0.388 | 0.329 |  |
| 6.644999999999561 | 0.388 | 0.33 |  |
| 6.63999999999956 | 0.388 | 0.33 |  |
| 6.634999999999561 | 0.388 | 0.33 |  |
| 6.629999999999561 | 0.388 | 0.33 |  |
| 6.624999999999561 | 0.389 | 0.33 |  |
| 6.619999999999561 | 0.389 | 0.33 |  |
| 6.614999999999561 | 0.389 | 0.33 |  |
| 6.609999999999561 | 0.389 | 0.33 |  |
| 6.604999999999562 | 0.389 | 0.33 |  |
| 6.599999999999561 | 0.389 | 0.33 |  |
| 6.594999999999562 | 0.389 | 0.33 |  |
| 6.589999999999561 | 0.39 | 0.33 |  |
| 6.584999999999562 | 0.39 | 0.331 |  |
| 6.579999999999562 | 0.39 | 0.331 |  |
| 6.574999999999562 | 0.39 | 0.331 |  |
| 6.569999999999562 | 0.39 | 0.331 |  |
| 6.564999999999563 | 0.39 | 0.331 |  |
| 6.559999999999562 | 0.39 | 0.331 |  |
| 6.554999999999563 | 0.391 | 0.331 |  |
| 6.549999999999562 | 0.391 | 0.331 |  |
| 6.544999999999563 | 0.391 | 0.331 |  |
| 6.539999999999563 | 0.391 | 0.331 |  |
| 6.534999999999563 | 0.391 | 0.331 |  |
| 6.529999999999563 | 0.391 | 0.331 |  |
| 6.524999999999563 | 0.391 | 0.331 |  |
| 6.519999999999563 | 0.392 | 0.332 |  |
| 6.514999999999564 | 0.392 | 0.332 |  |
| 6.509999999999563 | 0.392 | 0.332 |  |
| 6.504999999999564 | 0.392 | 0.332 |  |
| 6.499999999999563 | 0.392 | 0.332 |  |
| 6.494999999999564 | 0.392 | 0.332 |  |
| 6.489999999999564 | 0.393 | 0.332 |  |
| 6.484999999999564 | 0.393 | 0.332 |  |
| 6.479999999999564 | 0.393 | 0.332 |  |
| 6.474999999999564 | 0.393 | 0.332 |  |
| 6.469999999999564 | 0.393 | 0.332 |  |
| 6.464999999999564 | 0.393 | 0.332 |  |
| 6.459999999999564 | 0.393 | 0.333 |  |
| 6.454999999999564 | 0.394 | 0.333 |  |
| 6.449999999999564 | 0.394 | 0.333 |  |
| 6.444999999999565 | 0.394 | 0.333 |  |
| 6.439999999999565 | 0.394 | 0.333 |  |
| 6.434999999999565 | 0.394 | 0.333 |  |
| 6.429999999999565 | 0.394 | 0.333 |  |
| 6.424999999999565 | 0.395 | 0.333 |  |
| 6.419999999999565 | 0.395 | 0.333 |  |
| 6.414999999999565 | 0.395 | 0.333 |  |
| 6.409999999999565 | 0.395 | 0.333 |  |
| 6.404999999999565 | 0.395 | 0.333 |  |
| 6.399999999999565 | 0.395 | 0.334 |  |
| 6.394999999999566 | 0.395 | 0.334 |  |
| 6.389999999999566 | 0.396 | 0.334 |  |
| 6.384999999999566 | 0.396 | 0.334 |  |
| 6.379999999999566 | 0.396 | 0.334 |  |
| 6.374999999999566 | 0.396 | 0.334 |  |
| 6.369999999999566 | 0.396 | 0.334 |  |
| 6.364999999999567 | 0.396 | 0.334 |  |
| 6.359999999999566 | 0.397 | 0.334 |  |
| 6.354999999999567 | 0.397 | 0.334 |  |
| 6.349999999999567 | 0.397 | 0.334 |  |
| 6.344999999999567 | 0.397 | 0.334 |  |
| 6.339999999999567 | 0.397 | 0.335 |  |
| 6.334999999999567 | 0.397 | 0.335 |  |
| 6.329999999999567 | 0.397 | 0.335 |  |
| 6.324999999999568 | 0.398 | 0.335 |  |
| 6.319999999999567 | 0.398 | 0.335 |  |
| 6.314999999999568 | 0.398 | 0.335 |  |
| 6.309999999999567 | 0.398 | 0.335 |  |
| 6.304999999999568 | 0.398 | 0.335 |  |
| 6.299999999999568 | 0.398 | 0.335 |  |
| 6.294999999999568 | 0.399 | 0.335 |  |
| 6.289999999999568 | 0.399 | 0.335 |  |
| 6.284999999999568 | 0.399 | 0.335 |  |
| 6.279999999999568 | 0.399 | 0.336 |  |
| 6.274999999999568 | 0.399 | 0.336 |  |
| 6.269999999999568 | 0.399 | 0.336 |  |
| 6.264999999999569 | 0.4 | 0.336 |  |
| 6.259999999999568 | 0.4 | 0.336 |  |
| 6.25499999999957 | 0.4 | 0.336 |  |
| 6.24999999999957 | 0.4 | 0.336 |  |
| 6.24499999999957 | 0.4 | 0.336 |  |
| 6.23999999999957 | 0.4 | 0.336 |  |
| 6.23499999999957 | 0.4 | 0.336 |  |
| 6.22999999999957 | 0.401 | 0.336 |  |
| 6.22499999999957 | 0.401 | 0.336 |  |
| 6.21999999999957 | 0.401 | 0.336 |  |
| 6.21499999999957 | 0.401 | 0.337 |  |
| 6.20999999999957 | 0.401 | 0.337 |  |
| 6.20499999999957 | 0.401 | 0.337 |  |
| 6.19999999999957 | 0.402 | 0.337 |  |
| 6.19499999999957 | 0.402 | 0.337 |  |
| 6.18999999999957 | 0.402 | 0.337 |  |
| 6.184999999999571 | 0.402 | 0.337 |  |
| 6.17999999999957 | 0.402 | 0.337 |  |
| 6.174999999999571 | 0.402 | 0.337 |  |
| 6.169999999999571 | 0.403 | 0.337 |  |
| 6.164999999999571 | 0.403 | 0.337 |  |
| 6.159999999999571 | 0.403 | 0.338 |  |
| 6.154999999999571 | 0.403 | 0.338 |  |
| 6.149999999999571 | 0.403 | 0.338 |  |
| 6.144999999999571 | 0.403 | 0.338 |  |
| 6.139999999999571 | 0.404 | 0.338 |  |
| 6.134999999999572 | 0.404 | 0.338 |  |
| 6.129999999999572 | 0.404 | 0.338 |  |
| 6.124999999999572 | 0.404 | 0.338 |  |
| 6.119999999999572 | 0.404 | 0.338 |  |
| 6.114999999999572 | 0.404 | 0.338 |  |
| 6.109999999999572 | 0.405 | 0.338 |  |
| 6.104999999999572 | 0.405 | 0.338 |  |
| 6.099999999999572 | 0.405 | 0.339 |  |
| 6.094999999999573 | 0.405 | 0.339 |  |
| 6.089999999999572 | 0.405 | 0.339 |  |
| 6.084999999999573 | 0.405 | 0.339 |  |
| 6.079999999999572 | 0.406 | 0.339 |  |
| 6.074999999999573 | 0.406 | 0.339 |  |
| 6.069999999999573 | 0.406 | 0.339 |  |
| 6.064999999999573 | 0.406 | 0.339 |  |
| 6.059999999999573 | 0.406 | 0.339 |  |
| 6.054999999999573 | 0.406 | 0.339 |  |
| 6.049999999999573 | 0.407 | 0.339 |  |
| 6.044999999999574 | 0.407 | 0.339 |  |
| 6.039999999999573 | 0.407 | 0.34 |  |
| 6.034999999999574 | 0.407 | 0.34 |  |
| 6.029999999999574 | 0.407 | 0.34 |  |
| 6.024999999999574 | 0.407 | 0.34 |  |
| 6.019999999999574 | 0.408 | 0.34 |  |
| 6.014999999999574 | 0.408 | 0.34 |  |
| 6.009999999999574 | 0.408 | 0.34 |  |
| 6.004999999999574 | 0.408 | 0.34 |  |
| 5.999999999999574 | 0.408 | 0.34 |  |
| 5.994999999999574 | 0.408 | 0.34 |  |
| 5.989999999999574 | 0.409 | 0.34 |  |
| 5.984999999999574 | 0.409 | 0.34 |  |
| 5.979999999999574 | 0.409 | 0.341 |  |
| 5.974999999999575 | 0.409 | 0.341 |  |
| 5.969999999999575 | 0.409 | 0.341 |  |
| 5.964999999999575 | 0.409 | 0.341 |  |
| 5.959999999999575 | 0.41 | 0.341 |  |
| 5.954999999999575 | 0.41 | 0.341 |  |
| 5.949999999999575 | 0.41 | 0.341 |  |
| 5.944999999999575 | 0.41 | 0.341 |  |
| 5.939999999999575 | 0.41 | 0.341 |  |
| 5.934999999999575 | 0.41 | 0.341 |  |
| 5.929999999999576 | 0.411 | 0.341 |  |
| 5.924999999999576 | 0.411 | 0.341 |  |
| 5.919999999999576 | 0.411 | 0.342 |  |
| 5.914999999999576 | 0.411 | 0.342 |  |
| 5.909999999999576 | 0.411 | 0.342 |  |
| 5.904999999999576 | 0.412 | 0.342 |  |
| 5.899999999999576 | 0.412 | 0.342 |  |
| 5.894999999999577 | 0.412 | 0.342 |  |
| 5.889999999999576 | 0.412 | 0.342 |  |
| 5.884999999999577 | 0.412 | 0.342 |  |
| 5.879999999999577 | 0.412 | 0.342 |  |
| 5.874999999999577 | 0.413 | 0.342 |  |
| 5.869999999999577 | 0.413 | 0.342 |  |
| 5.864999999999577 | 0.413 | 0.343 |  |
| 5.859999999999577 | 0.413 | 0.343 |  |
| 5.854999999999578 | 0.413 | 0.343 |  |
| 5.849999999999577 | 0.413 | 0.343 |  |
| 5.844999999999578 | 0.414 | 0.343 |  |
| 5.839999999999577 | 0.414 | 0.343 |  |
| 5.834999999999578 | 0.414 | 0.343 |  |
| 5.829999999999578 | 0.414 | 0.343 |  |
| 5.824999999999578 | 0.414 | 0.343 |  |
| 5.819999999999578 | 0.415 | 0.343 |  |
| 5.814999999999578 | 0.415 | 0.343 |  |
| 5.809999999999578 | 0.415 | 0.343 |  |
| 5.804999999999579 | 0.415 | 0.344 |  |
| 5.799999999999578 | 0.415 | 0.344 |  |
| 5.794999999999579 | 0.415 | 0.344 |  |
| 5.789999999999578 | 0.416 | 0.344 |  |
| 5.78499999999958 | 0.416 | 0.344 |  |
| 5.77999999999958 | 0.416 | 0.344 |  |
| 5.77499999999958 | 0.416 | 0.344 |  |
| 5.76999999999958 | 0.416 | 0.344 |  |
| 5.764999999999579 | 0.416 | 0.344 |  |
| 5.75999999999958 | 0.417 | 0.344 |  |
| 5.75499999999958 | 0.417 | 0.344 |  |
| 5.74999999999958 | 0.417 | 0.345 |  |
| 5.74499999999958 | 0.417 | 0.345 |  |
| 5.73999999999958 | 0.417 | 0.345 |  |
| 5.73499999999958 | 0.418 | 0.345 |  |
| 5.72999999999958 | 0.418 | 0.345 |  |
| 5.72499999999958 | 0.418 | 0.345 |  |
| 5.71999999999958 | 0.418 | 0.345 |  |
| 5.714999999999581 | 0.418 | 0.345 |  |
| 5.70999999999958 | 0.418 | 0.345 |  |
| 5.704999999999581 | 0.419 | 0.345 |  |
| 5.699999999999581 | 0.419 | 0.345 |  |
| 5.694999999999581 | 0.419 | 0.345 |  |
| 5.689999999999581 | 0.419 | 0.346 |  |
| 5.684999999999581 | 0.419 | 0.346 |  |
| 5.679999999999581 | 0.42 | 0.346 |  |
| 5.674999999999581 | 0.42 | 0.346 |  |
| 5.669999999999581 | 0.42 | 0.346 |  |
| 5.664999999999582 | 0.42 | 0.346 |  |
| 5.659999999999582 | 0.42 | 0.346 |  |
| 5.654999999999582 | 0.421 | 0.346 |  |
| 5.649999999999582 | 0.421 | 0.346 |  |
| 5.644999999999582 | 0.421 | 0.346 |  |
| 5.639999999999582 | 0.421 | 0.346 |  |
| 5.634999999999582 | 0.421 | 0.347 |  |
| 5.629999999999582 | 0.421 | 0.347 |  |
| 5.624999999999582 | 0.422 | 0.347 |  |
| 5.619999999999583 | 0.422 | 0.347 |  |
| 5.614999999999583 | 0.422 | 0.347 |  |
| 5.609999999999583 | 0.422 | 0.347 |  |
| 5.604999999999583 | 0.422 | 0.347 |  |
| 5.599999999999583 | 0.423 | 0.347 |  |
| 5.594999999999583 | 0.423 | 0.347 |  |
| 5.589999999999583 | 0.423 | 0.347 |  |
| 5.584999999999583 | 0.423 | 0.347 |  |
| 5.579999999999583 | 0.423 | 0.347 |  |
| 5.574999999999584 | 0.424 | 0.348 |  |
| 5.569999999999584 | 0.424 | 0.348 |  |
| 5.564999999999584 | 0.424 | 0.348 |  |
| 5.559999999999584 | 0.424 | 0.348 |  |
| 5.554999999999584 | 0.424 | 0.348 |  |
| 5.549999999999584 | 0.424 | 0.348 |  |
| 5.544999999999584 | 0.425 | 0.348 |  |
| 5.539999999999584 | 0.425 | 0.348 |  |
| 5.534999999999584 | 0.425 | 0.348 |  |
| 5.529999999999584 | 0.425 | 0.348 |  |
| 5.524999999999585 | 0.425 | 0.348 |  |
| 5.519999999999584 | 0.426 | 0.349 |  |
| 5.514999999999585 | 0.426 | 0.349 |  |
| 5.509999999999585 | 0.426 | 0.349 |  |
| 5.504999999999585 | 0.426 | 0.349 |  |
| 5.499999999999585 | 0.426 | 0.349 |  |
| 5.494999999999585 | 0.427 | 0.349 |  |
| 5.489999999999585 | 0.427 | 0.349 |  |
| 5.484999999999585 | 0.427 | 0.349 |  |
| 5.479999999999585 | 0.427 | 0.349 |  |
| 5.474999999999585 | 0.427 | 0.349 |  |
| 5.469999999999585 | 0.428 | 0.349 |  |
| 5.464999999999586 | 0.428 | 0.349 |  |
| 5.459999999999586 | 0.428 | 0.35 |  |
| 5.454999999999586 | 0.428 | 0.35 |  |
| 5.449999999999586 | 0.428 | 0.35 |  |
| 5.444999999999586 | 0.429 | 0.35 |  |
| 5.439999999999586 | 0.429 | 0.35 |  |
| 5.434999999999586 | 0.429 | 0.35 |  |
| 5.429999999999586 | 0.429 | 0.35 |  |
| 5.424999999999587 | 0.429 | 0.35 |  |
| 5.419999999999586 | 0.43 | 0.35 |  |
| 5.414999999999587 | 0.43 | 0.35 |  |
| 5.409999999999587 | 0.43 | 0.35 |  |
| 5.404999999999587 | 0.43 | 0.351 |  |
| 5.399999999999587 | 0.43 | 0.351 |  |
| 5.394999999999587 | 0.431 | 0.351 |  |
| 5.389999999999587 | 0.431 | 0.351 |  |
| 5.384999999999588 | 0.431 | 0.351 |  |
| 5.379999999999587 | 0.431 | 0.351 |  |
| 5.374999999999588 | 0.431 | 0.351 |  |
| 5.369999999999588 | 0.432 | 0.351 |  |
| 5.364999999999588 | 0.432 | 0.351 |  |
| 5.359999999999588 | 0.432 | 0.351 |  |
| 5.354999999999588 | 0.432 | 0.351 |  |
| 5.349999999999588 | 0.432 | 0.352 |  |
| 5.344999999999588 | 0.433 | 0.352 |  |
| 5.339999999999588 | 0.433 | 0.352 |  |
| 5.334999999999589 | 0.433 | 0.352 |  |
| 5.329999999999589 | 0.433 | 0.352 |  |
| 5.324999999999589 | 0.433 | 0.352 |  |
| 5.31999999999959 | 0.434 | 0.352 |  |
| 5.314999999999589 | 0.434 | 0.352 |  |
| 5.30999999999959 | 0.434 | 0.352 |  |
| 5.304999999999589 | 0.434 | 0.352 |  |
| 5.29999999999959 | 0.434 | 0.352 |  |
| 5.29499999999959 | 0.435 | 0.353 |  |
| 5.28999999999959 | 0.435 | 0.353 |  |
| 5.28499999999959 | 0.435 | 0.353 |  |
| 5.27999999999959 | 0.435 | 0.353 |  |
| 5.27499999999959 | 0.435 | 0.353 |  |
| 5.26999999999959 | 0.436 | 0.353 |  |
| 5.26499999999959 | 0.436 | 0.353 |  |
| 5.25999999999959 | 0.436 | 0.353 |  |
| 5.25499999999959 | 0.436 | 0.353 |  |
| 5.24999999999959 | 0.436 | 0.353 |  |
| 5.244999999999591 | 0.437 | 0.353 |  |
| 5.23999999999959 | 0.437 | 0.353 |  |
| 5.234999999999591 | 0.437 | 0.354 |  |
| 5.229999999999591 | 0.437 | 0.354 |  |
| 5.224999999999591 | 0.437 | 0.354 |  |
| 5.219999999999591 | 0.438 | 0.354 |  |
| 5.214999999999591 | 0.438 | 0.354 |  |
| 5.209999999999591 | 0.438 | 0.354 |  |
| 5.204999999999591 | 0.438 | 0.354 |  |
| 5.199999999999592 | 0.439 | 0.354 |  |
| 5.194999999999592 | 0.439 | 0.354 |  |
| 5.189999999999592 | 0.439 | 0.354 |  |
| 5.184999999999592 | 0.439 | 0.354 |  |
| 5.179999999999592 | 0.439 | 0.355 |  |
| 5.174999999999592 | 0.44 | 0.355 |  |
| 5.169999999999592 | 0.44 | 0.355 |  |
| 5.164999999999592 | 0.44 | 0.355 |  |
| 5.159999999999592 | 0.44 | 0.355 |  |
| 5.154999999999593 | 0.44 | 0.355 |  |
| 5.149999999999593 | 0.441 | 0.355 |  |
| 5.144999999999593 | 0.441 | 0.355 |  |
| 5.139999999999593 | 0.441 | 0.355 |  |
| 5.134999999999593 | 0.441 | 0.355 |  |
| 5.129999999999593 | 0.442 | 0.355 |  |
| 5.124999999999593 | 0.442 | 0.356 |  |
| 5.119999999999593 | 0.442 | 0.356 |  |
| 5.114999999999593 | 0.442 | 0.356 |  |
| 5.109999999999594 | 0.442 | 0.356 |  |
| 5.104999999999594 | 0.443 | 0.356 |  |
| 5.099999999999594 | 0.443 | 0.356 |  |
| 5.094999999999594 | 0.443 | 0.356 |  |
| 5.089999999999594 | 0.443 | 0.356 |  |
| 5.084999999999594 | 0.443 | 0.356 |  |
| 5.079999999999594 | 0.444 | 0.356 |  |
| 5.074999999999594 | 0.444 | 0.356 |  |
| 5.069999999999594 | 0.444 | 0.357 |  |
| 5.064999999999594 | 0.444 | 0.357 |  |
| 5.059999999999594 | 0.445 | 0.357 |  |
| 5.054999999999595 | 0.445 | 0.357 |  |
| 5.049999999999594 | 0.445 | 0.357 |  |
| 5.044999999999595 | 0.445 | 0.357 |  |
| 5.039999999999595 | 0.445 | 0.357 |  |
| 5.034999999999595 | 0.446 | 0.357 |  |
| 5.029999999999595 | 0.446 | 0.357 |  |
| 5.024999999999595 | 0.446 | 0.357 |  |
| 5.019999999999595 | 0.446 | 0.357 |  |
| 5.014999999999596 | 0.447 | 0.358 |  |
| 5.009999999999595 | 0.447 | 0.358 |  |
| 5.004999999999596 | 0.447 | 0.358 |  |
| 4.999999999999595 | 0.447 | 0.358 |  |
| 4.994999999999596 | 0.447 | 0.358 |  |
| 4.989999999999596 | 0.448 | 0.358 |  |
| 4.984999999999596 | 0.448 | 0.358 |  |
| 4.979999999999596 | 0.448 | 0.358 |  |
| 4.974999999999596 | 0.448 | 0.358 |  |
| 4.969999999999596 | 0.449 | 0.358 |  |
| 4.964999999999597 | 0.449 | 0.358 |  |
| 4.959999999999596 | 0.449 | 0.358 |  |
| 4.954999999999597 | 0.449 | 0.359 |  |
| 4.949999999999596 | 0.449 | 0.359 |  |
| 4.944999999999597 | 0.45 | 0.359 |  |
| 4.939999999999597 | 0.45 | 0.359 |  |
| 4.934999999999597 | 0.45 | 0.359 |  |
| 4.929999999999597 | 0.45 | 0.359 |  |
| 4.924999999999597 | 0.451 | 0.359 |  |
| 4.919999999999597 | 0.451 | 0.359 |  |
| 4.914999999999598 | 0.451 | 0.359 |  |
| 4.909999999999597 | 0.451 | 0.359 |  |
| 4.904999999999598 | 0.452 | 0.359 |  |
| 4.899999999999598 | 0.452 | 0.36 |  |
| 4.894999999999598 | 0.452 | 0.36 |  |
| 4.889999999999598 | 0.452 | 0.36 |  |
| 4.884999999999598 | 0.452 | 0.36 |  |
| 4.879999999999598 | 0.453 | 0.36 |  |
| 4.874999999999598 | 0.453 | 0.36 |  |
| 4.869999999999599 | 0.453 | 0.36 |  |
| 4.864999999999599 | 0.453 | 0.36 |  |
| 4.859999999999599 | 0.454 | 0.36 |  |
| 4.854999999999599 | 0.454 | 0.36 |  |
| 4.8499999999996 | 0.454 | 0.36 |  |
| 4.844999999999599 | 0.454 | 0.361 |  |
| 4.8399999999996 | 0.455 | 0.361 |  |
| 4.834999999999599 | 0.455 | 0.361 |  |
| 4.829999999999599 | 0.455 | 0.361 |  |
| 4.8249999999996 | 0.455 | 0.361 |  |
| 4.8199999999996 | 0.455 | 0.361 |  |
| 4.8149999999996 | 0.456 | 0.361 |  |
| 4.8099999999996 | 0.456 | 0.361 |  |
| 4.8049999999996 | 0.456 | 0.361 |  |
| 4.7999999999996 | 0.456 | 0.361 |  |
| 4.7949999999996 | 0.457 | 0.361 |  |
| 4.7899999999996 | 0.457 | 0.362 |  |
| 4.7849999999996 | 0.457 | 0.362 |  |
| 4.7799999999996 | 0.457 | 0.362 |  |
| 4.7749999999996 | 0.458 | 0.362 |  |
| 4.7699999999996 | 0.458 | 0.362 |  |
| 4.764999999999601 | 0.458 | 0.362 |  |
| 4.7599999999996 | 0.458 | 0.362 |  |
| 4.754999999999601 | 0.459 | 0.362 |  |
| 4.7499999999996 | 0.459 | 0.362 |  |
| 4.744999999999601 | 0.459 | 0.362 |  |
| 4.7399999999996 | 0.459 | 0.362 |  |
| 4.734999999999601 | 0.46 | 0.363 |  |
| 4.729999999999601 | 0.46 | 0.363 |  |
| 4.724999999999602 | 0.46 | 0.363 |  |
| 4.719999999999601 | 0.46 | 0.363 |  |
| 4.714999999999602 | 0.461 | 0.363 |  |
| 4.709999999999601 | 0.461 | 0.363 |  |
| 4.704999999999602 | 0.461 | 0.363 |  |
| 4.699999999999602 | 0.461 | 0.363 |  |
| 4.694999999999602 | 0.462 | 0.363 |  |
| 4.689999999999602 | 0.462 | 0.363 |  |
| 4.684999999999602 | 0.462 | 0.363 |  |
| 4.679999999999602 | 0.462 | 0.363 |  |
| 4.674999999999603 | 0.462 | 0.364 |  |
| 4.669999999999603 | 0.463 | 0.364 |  |
| 4.664999999999603 | 0.463 | 0.364 |  |
| 4.659999999999603 | 0.463 | 0.364 |  |
| 4.654999999999603 | 0.463 | 0.364 |  |
| 4.649999999999603 | 0.464 | 0.364 |  |
| 4.644999999999603 | 0.464 | 0.364 |  |
| 4.639999999999603 | 0.464 | 0.364 |  |
| 4.634999999999604 | 0.464 | 0.364 |  |
| 4.629999999999604 | 0.465 | 0.364 |  |
| 4.624999999999604 | 0.465 | 0.364 |  |
| 4.619999999999604 | 0.465 | 0.365 |  |
| 4.614999999999604 | 0.465 | 0.365 |  |
| 4.609999999999604 | 0.466 | 0.365 |  |
| 4.604999999999604 | 0.466 | 0.365 |  |
| 4.599999999999604 | 0.466 | 0.365 |  |
| 4.594999999999604 | 0.467 | 0.365 |  |
| 4.589999999999604 | 0.467 | 0.365 |  |
| 4.584999999999604 | 0.467 | 0.365 |  |
| 4.579999999999604 | 0.467 | 0.365 |  |
| 4.574999999999604 | 0.468 | 0.365 |  |
| 4.569999999999605 | 0.468 | 0.365 |  |
| 4.564999999999605 | 0.468 | 0.366 |  |
| 4.559999999999605 | 0.468 | 0.366 |  |
| 4.554999999999605 | 0.469 | 0.366 |  |
| 4.549999999999605 | 0.469 | 0.366 |  |
| 4.544999999999605 | 0.469 | 0.366 |  |
| 4.539999999999605 | 0.469 | 0.366 |  |
| 4.534999999999605 | 0.47 | 0.366 |  |
| 4.529999999999605 | 0.47 | 0.366 |  |
| 4.524999999999606 | 0.47 | 0.366 |  |
| 4.519999999999606 | 0.47 | 0.366 |  |
| 4.514999999999606 | 0.471 | 0.366 |  |
| 4.509999999999606 | 0.471 | 0.366 |  |
| 4.504999999999606 | 0.471 | 0.367 |  |
| 4.499999999999606 | 0.471 | 0.367 |  |
| 4.494999999999606 | 0.472 | 0.367 |  |
| 4.489999999999606 | 0.472 | 0.367 |  |
| 4.484999999999606 | 0.472 | 0.367 |  |
| 4.479999999999606 | 0.472 | 0.367 |  |
| 4.474999999999607 | 0.473 | 0.367 |  |
| 4.469999999999607 | 0.473 | 0.367 |  |
| 4.464999999999607 | 0.473 | 0.367 |  |
| 4.459999999999607 | 0.474 | 0.367 |  |
| 4.454999999999607 | 0.474 | 0.367 |  |
| 4.449999999999607 | 0.474 | 0.368 |  |
| 4.444999999999607 | 0.474 | 0.368 |  |
| 4.439999999999607 | 0.475 | 0.368 |  |
| 4.434999999999607 | 0.475 | 0.368 |  |
| 4.429999999999607 | 0.475 | 0.368 |  |
| 4.424999999999608 | 0.475 | 0.368 |  |
| 4.419999999999608 | 0.476 | 0.368 |  |
| 4.414999999999608 | 0.476 | 0.368 |  |
| 4.409999999999608 | 0.476 | 0.368 |  |
| 4.404999999999608 | 0.476 | 0.368 |  |
| 4.399999999999608 | 0.477 | 0.368 |  |
| 4.394999999999609 | 0.477 | 0.368 |  |
| 4.389999999999608 | 0.477 | 0.369 |  |
| 4.384999999999609 | 0.478 | 0.369 |  |
| 4.37999999999961 | 0.478 | 0.369 |  |
| 4.37499999999961 | 0.478 | 0.369 |  |
| 4.36999999999961 | 0.478 | 0.369 |  |
| 4.364999999999609 | 0.479 | 0.369 |  |
| 4.35999999999961 | 0.479 | 0.369 |  |
| 4.35499999999961 | 0.479 | 0.369 |  |
| 4.34999999999961 | 0.479 | 0.369 |  |
| 4.34499999999961 | 0.48 | 0.369 |  |
| 4.33999999999961 | 0.48 | 0.369 |  |
| 4.33499999999961 | 0.48 | 0.369 |  |
| 4.32999999999961 | 0.481 | 0.37 |  |
| 4.32499999999961 | 0.481 | 0.37 |  |
| 4.31999999999961 | 0.481 | 0.37 |  |
| 4.31499999999961 | 0.481 | 0.37 |  |
| 4.30999999999961 | 0.482 | 0.37 |  |
| 4.304999999999611 | 0.482 | 0.37 |  |
| 4.29999999999961 | 0.482 | 0.37 |  |
| 4.294999999999611 | 0.483 | 0.37 |  |
| 4.28999999999961 | 0.483 | 0.37 |  |
| 4.284999999999611 | 0.483 | 0.37 |  |
| 4.27999999999961 | 0.483 | 0.37 |  |
| 4.274999999999611 | 0.484 | 0.371 |  |
| 4.269999999999611 | 0.484 | 0.371 |  |
| 4.264999999999612 | 0.484 | 0.371 |  |
| 4.259999999999611 | 0.485 | 0.371 |  |
| 4.254999999999612 | 0.485 | 0.371 |  |
| 4.249999999999611 | 0.485 | 0.371 |  |
| 4.244999999999612 | 0.485 | 0.371 |  |
| 4.239999999999612 | 0.486 | 0.371 |  |
| 4.234999999999612 | 0.486 | 0.371 |  |
| 4.229999999999612 | 0.486 | 0.371 |  |
| 4.224999999999612 | 0.487 | 0.371 |  |
| 4.219999999999612 | 0.487 | 0.371 |  |
| 4.214999999999613 | 0.487 | 0.372 |  |
| 4.209999999999612 | 0.487 | 0.372 |  |
| 4.204999999999613 | 0.488 | 0.372 |  |
| 4.199999999999613 | 0.488 | 0.372 |  |
| 4.194999999999613 | 0.488 | 0.372 |  |
| 4.189999999999613 | 0.489 | 0.372 |  |
| 4.184999999999613 | 0.489 | 0.372 |  |
| 4.179999999999613 | 0.489 | 0.372 |  |
| 4.174999999999613 | 0.489 | 0.372 |  |
| 4.169999999999614 | 0.49 | 0.372 |  |
| 4.164999999999614 | 0.49 | 0.372 |  |
| 4.159999999999614 | 0.49 | 0.372 |  |
| 4.154999999999614 | 0.491 | 0.373 |  |
| 4.149999999999614 | 0.491 | 0.373 |  |
| 4.144999999999614 | 0.491 | 0.373 |  |
| 4.139999999999614 | 0.491 | 0.373 |  |
| 4.134999999999614 | 0.492 | 0.373 |  |
| 4.129999999999614 | 0.492 | 0.373 |  |
| 4.124999999999615 | 0.492 | 0.373 |  |
| 4.119999999999614 | 0.493 | 0.373 |  |
| 4.114999999999615 | 0.493 | 0.373 |  |
| 4.109999999999614 | 0.493 | 0.373 |  |
| 4.104999999999615 | 0.494 | 0.373 |  |
| 4.099999999999615 | 0.494 | 0.373 |  |
| 4.094999999999615 | 0.494 | 0.373 |  |
| 4.089999999999615 | 0.494 | 0.374 |  |
| 4.084999999999615 | 0.495 | 0.374 |  |
| 4.079999999999615 | 0.495 | 0.374 |  |
| 4.074999999999615 | 0.495 | 0.374 |  |
| 4.069999999999615 | 0.496 | 0.374 |  |
| 4.064999999999616 | 0.496 | 0.374 |  |
| 4.059999999999615 | 0.496 | 0.374 |  |
| 4.054999999999616 | 0.497 | 0.374 |  |
| 4.049999999999616 | 0.497 | 0.374 |  |
| 4.044999999999616 | 0.497 | 0.374 |  |
| 4.039999999999616 | 0.498 | 0.374 |  |
| 4.034999999999616 | 0.498 | 0.374 |  |
| 4.029999999999616 | 0.498 | 0.375 |  |
| 4.024999999999617 | 0.498 | 0.375 |  |
| 4.019999999999616 | 0.499 | 0.375 |  |
| 4.014999999999617 | 0.499 | 0.375 |  |
| 4.009999999999616 | 0.499 | 0.375 |  |
| 4.004999999999617 | 0.5 | 0.375 |  |
| 3.999999999999617 | 0.5 | 0.375 |  |
| 3.994999999999617 | 0.5 | 0.375 |  |
| 3.989999999999617 | 0.501 | 0.375 |  |
| 3.984999999999617 | 0.501 | 0.375 |  |
| 3.979999999999618 | 0.501 | 0.375 |  |
| 3.974999999999618 | 0.502 | 0.375 |  |
| 3.969999999999618 | 0.502 | 0.375 |  |
| 3.964999999999618 | 0.502 | 0.376 |  |
| 3.959999999999618 | 0.503 | 0.376 |  |
| 3.954999999999618 | 0.503 | 0.376 |  |
| 3.949999999999618 | 0.503 | 0.376 |  |
| 3.944999999999618 | 0.503 | 0.376 |  |
| 3.939999999999618 | 0.504 | 0.376 |  |
| 3.934999999999619 | 0.504 | 0.376 |  |
| 3.929999999999619 | 0.504 | 0.376 |  |
| 3.924999999999619 | 0.505 | 0.376 |  |
| 3.919999999999619 | 0.505 | 0.376 |  |
| 3.914999999999619 | 0.505 | 0.376 |  |
| 3.909999999999619 | 0.506 | 0.376 |  |
| 3.904999999999619 | 0.506 | 0.376 |  |
| 3.899999999999619 | 0.506 | 0.377 |  |
| 3.894999999999619 | 0.507 | 0.377 |  |
| 3.889999999999619 | 0.507 | 0.377 |  |
| 3.88499999999962 | 0.507 | 0.377 |  |
| 3.87999999999962 | 0.508 | 0.377 |  |
| 3.87499999999962 | 0.508 | 0.377 |  |
| 3.86999999999962 | 0.508 | 0.377 |  |
| 3.86499999999962 | 0.509 | 0.377 |  |
| 3.85999999999962 | 0.509 | 0.377 |  |
| 3.85499999999962 | 0.509 | 0.377 |  |
| 3.84999999999962 | 0.51 | 0.377 |  |
| 3.84499999999962 | 0.51 | 0.377 |  |
| 3.839999999999621 | 0.51 | 0.377 |  |
| 3.834999999999621 | 0.511 | 0.377 |  |
| 3.829999999999621 | 0.511 | 0.378 |  |
| 3.824999999999621 | 0.511 | 0.378 |  |
| 3.819999999999621 | 0.512 | 0.378 |  |
| 3.814999999999621 | 0.512 | 0.378 |  |
| 3.809999999999621 | 0.512 | 0.378 |  |
| 3.804999999999621 | 0.513 | 0.378 |  |
| 3.799999999999621 | 0.513 | 0.378 |  |
| 3.794999999999621 | 0.513 | 0.378 |  |
| 3.789999999999622 | 0.514 | 0.378 |  |
| 3.784999999999622 | 0.514 | 0.378 |  |
| 3.779999999999622 | 0.514 | 0.378 |  |
| 3.774999999999622 | 0.515 | 0.378 |  |
| 3.769999999999622 | 0.515 | 0.378 |  |
| 3.764999999999622 | 0.515 | 0.378 |  |
| 3.759999999999622 | 0.516 | 0.379 |  |
| 3.754999999999622 | 0.516 | 0.379 |  |
| 3.749999999999622 | 0.516 | 0.379 |  |
| 3.744999999999623 | 0.517 | 0.379 |  |
| 3.739999999999623 | 0.517 | 0.379 |  |
| 3.734999999999623 | 0.517 | 0.379 |  |
| 3.729999999999623 | 0.518 | 0.379 |  |
| 3.724999999999623 | 0.518 | 0.379 |  |
| 3.719999999999623 | 0.518 | 0.379 |  |
| 3.714999999999623 | 0.519 | 0.379 |  |
| 3.709999999999623 | 0.519 | 0.379 |  |
| 3.704999999999623 | 0.52 | 0.379 |  |
| 3.699999999999623 | 0.52 | 0.379 |  |
| 3.694999999999624 | 0.52 | 0.379 |  |
| 3.689999999999624 | 0.521 | 0.38 |  |
| 3.684999999999624 | 0.521 | 0.38 |  |
| 3.679999999999624 | 0.521 | 0.38 |  |
| 3.674999999999624 | 0.522 | 0.38 |  |
| 3.669999999999624 | 0.522 | 0.38 |  |
| 3.664999999999624 | 0.522 | 0.38 |  |
| 3.659999999999624 | 0.523 | 0.38 |  |
| 3.654999999999624 | 0.523 | 0.38 |  |
| 3.649999999999625 | 0.523 | 0.38 |  |
| 3.644999999999625 | 0.524 | 0.38 |  |
| 3.639999999999625 | 0.524 | 0.38 |  |
| 3.634999999999625 | 0.525 | 0.38 |  |
| 3.629999999999625 | 0.525 | 0.38 |  |
| 3.624999999999625 | 0.525 | 0.38 |  |
| 3.619999999999625 | 0.526 | 0.38 |  |
| 3.614999999999625 | 0.526 | 0.38 |  |
| 3.609999999999625 | 0.526 | 0.381 |  |
| 3.604999999999626 | 0.527 | 0.381 |  |
| 3.599999999999626 | 0.527 | 0.381 |  |
| 3.594999999999626 | 0.527 | 0.381 |  |
| 3.589999999999626 | 0.528 | 0.381 |  |
| 3.584999999999626 | 0.528 | 0.381 |  |
| 3.579999999999626 | 0.529 | 0.381 |  |
| 3.574999999999626 | 0.529 | 0.381 |  |
| 3.569999999999626 | 0.529 | 0.381 |  |
| 3.564999999999626 | 0.53 | 0.381 |  |
| 3.559999999999627 | 0.53 | 0.381 |  |
| 3.554999999999627 | 0.53 | 0.381 |  |
| 3.549999999999627 | 0.531 | 0.381 |  |
| 3.544999999999627 | 0.531 | 0.381 |  |
| 3.539999999999627 | 0.531 | 0.381 |  |
| 3.534999999999627 | 0.532 | 0.381 |  |
| 3.529999999999627 | 0.532 | 0.381 |  |
| 3.524999999999627 | 0.533 | 0.382 |  |
| 3.519999999999627 | 0.533 | 0.382 |  |
| 3.514999999999628 | 0.533 | 0.382 |  |
| 3.509999999999628 | 0.534 | 0.382 |  |
| 3.504999999999628 | 0.534 | 0.382 |  |
| 3.499999999999628 | 0.535 | 0.382 |  |
| 3.494999999999628 | 0.535 | 0.382 |  |
| 3.489999999999628 | 0.535 | 0.382 |  |
| 3.484999999999628 | 0.536 | 0.382 |  |
| 3.479999999999628 | 0.536 | 0.382 |  |
| 3.474999999999628 | 0.536 | 0.382 |  |
| 3.469999999999628 | 0.537 | 0.382 |  |
| 3.464999999999629 | 0.537 | 0.382 |  |
| 3.459999999999629 | 0.538 | 0.382 |  |
| 3.454999999999629 | 0.538 | 0.382 |  |
| 3.449999999999629 | 0.538 | 0.382 |  |
| 3.444999999999629 | 0.539 | 0.382 |  |
| 3.439999999999629 | 0.539 | 0.382 |  |
| 3.434999999999629 | 0.54 | 0.382 |  |
| 3.429999999999629 | 0.54 | 0.383 |  |
| 3.424999999999629 | 0.54 | 0.383 |  |
| 3.41999999999963 | 0.541 | 0.383 |  |
| 3.41499999999963 | 0.541 | 0.383 |  |
| 3.40999999999963 | 0.542 | 0.383 |  |
| 3.40499999999963 | 0.542 | 0.383 |  |
| 3.39999999999963 | 0.542 | 0.383 |  |
| 3.39499999999963 | 0.543 | 0.383 |  |
| 3.38999999999963 | 0.543 | 0.383 |  |
| 3.38499999999963 | 0.544 | 0.383 |  |
| 3.37999999999963 | 0.544 | 0.383 |  |
| 3.37499999999963 | 0.544 | 0.383 |  |
| 3.369999999999631 | 0.545 | 0.383 |  |
| 3.364999999999631 | 0.545 | 0.383 |  |
| 3.359999999999631 | 0.546 | 0.383 |  |
| 3.354999999999631 | 0.546 | 0.383 |  |
| 3.349999999999631 | 0.546 | 0.383 |  |
| 3.344999999999631 | 0.547 | 0.383 |  |
| 3.339999999999631 | 0.547 | 0.383 |  |
| 3.334999999999631 | 0.548 | 0.383 |  |
| 3.329999999999631 | 0.548 | 0.383 |  |
| 3.324999999999632 | 0.548 | 0.383 |  |
| 3.319999999999632 | 0.549 | 0.384 |  |
| 3.314999999999632 | 0.549 | 0.384 |  |
| 3.309999999999632 | 0.55 | 0.384 |  |
| 3.304999999999632 | 0.55 | 0.384 |  |
| 3.299999999999632 | 0.55 | 0.384 |  |
| 3.294999999999632 | 0.551 | 0.384 |  |
| 3.289999999999632 | 0.551 | 0.384 |  |
| 3.284999999999632 | 0.552 | 0.384 |  |
| 3.279999999999633 | 0.552 | 0.384 |  |
| 3.274999999999633 | 0.553 | 0.384 |  |
| 3.269999999999633 | 0.553 | 0.384 |  |
| 3.264999999999633 | 0.553 | 0.384 |  |
| 3.259999999999633 | 0.554 | 0.384 |  |
| 3.254999999999633 | 0.554 | 0.384 |  |
| 3.249999999999633 | 0.555 | 0.384 |  |
| 3.244999999999633 | 0.555 | 0.384 |  |
| 3.239999999999633 | 0.556 | 0.384 |  |
| 3.234999999999633 | 0.556 | 0.384 |  |
| 3.229999999999634 | 0.556 | 0.384 |  |
| 3.224999999999634 | 0.557 | 0.384 |  |
| 3.219999999999634 | 0.557 | 0.384 |  |
| 3.214999999999634 | 0.558 | 0.384 |  |
| 3.209999999999634 | 0.558 | 0.384 |  |
| 3.204999999999634 | 0.559 | 0.384 |  |
| 3.199999999999634 | 0.559 | 0.384 |  |
| 3.194999999999634 | 0.559 | 0.384 |  |
| 3.189999999999634 | 0.56 | 0.384 |  |
| 3.184999999999635 | 0.56 | 0.384 |  |
| 3.179999999999635 | 0.561 | 0.384 |  |
| 3.174999999999635 | 0.561 | 0.384 |  |
| 3.169999999999635 | 0.562 | 0.384 |  |
| 3.164999999999635 | 0.562 | 0.385 |  |
| 3.159999999999635 | 0.563 | 0.385 |  |
| 3.154999999999635 | 0.563 | 0.385 |  |
| 3.149999999999635 | 0.563 | 0.385 |  |
| 3.144999999999635 | 0.564 | 0.385 |  |
| 3.139999999999636 | 0.564 | 0.385 |  |
| 3.134999999999636 | 0.565 | 0.385 |  |
| 3.129999999999636 | 0.565 | 0.385 |  |
| 3.124999999999636 | 0.566 | 0.385 |  |
| 3.119999999999636 | 0.566 | 0.385 |  |
| 3.114999999999636 | 0.567 | 0.385 |  |
| 3.109999999999636 | 0.567 | 0.385 |  |
| 3.104999999999636 | 0.568 | 0.385 |  |
| 3.099999999999636 | 0.568 | 0.385 |  |
| 3.094999999999636 | 0.568 | 0.385 |  |
| 3.089999999999637 | 0.569 | 0.385 |  |
| 3.084999999999637 | 0.569 | 0.385 |  |
| 3.079999999999637 | 0.57 | 0.385 |  |
| 3.074999999999637 | 0.57 | 0.385 |  |
| 3.069999999999637 | 0.571 | 0.385 |  |
| 3.064999999999637 | 0.571 | 0.385 |  |
| 3.059999999999637 | 0.572 | 0.385 |  |
| 3.054999999999637 | 0.572 | 0.385 |  |
| 3.049999999999637 | 0.573 | 0.385 |  |
| 3.044999999999638 | 0.573 | 0.385 |  |
| 3.039999999999638 | 0.574 | 0.385 |  |
| 3.034999999999638 | 0.574 | 0.385 |  |
| 3.029999999999638 | 0.574 | 0.385 |  |
| 3.024999999999638 | 0.575 | 0.385 |  |
| 3.019999999999638 | 0.575 | 0.385 |  |
| 3.014999999999638 | 0.576 | 0.385 |  |
| 3.009999999999638 | 0.576 | 0.385 |  |
| 3.004999999999638 | 0.577 | 0.385 |  |
| 2.999999999999638 | 0.577 | 0.385 |  |
| 2.994999999999639 | 0.578 | 0.385 |  |
| 2.989999999999639 | 0.578 | 0.385 |  |
| 2.984999999999639 | 0.579 | 0.385 |  |
| 2.979999999999639 | 0.579 | 0.385 |  |
| 2.974999999999639 | 0.58 | 0.385 |  |
| 2.969999999999639 | 0.58 | 0.385 |  |
| 2.964999999999639 | 0.581 | 0.385 |  |
| 2.959999999999639 | 0.581 | 0.385 |  |
| 2.954999999999639 | 0.582 | 0.385 |  |
| 2.94999999999964 | 0.582 | 0.385 |  |
| 2.94499999999964 | 0.583 | 0.385 |  |
| 2.93999999999964 | 0.583 | 0.385 |  |
| 2.93499999999964 | 0.584 | 0.385 |  |
| 2.92999999999964 | 0.584 | 0.385 |  |
| 2.92499999999964 | 0.585 | 0.385 |  |
| 2.91999999999964 | 0.585 | 0.385 |  |
| 2.91499999999964 | 0.586 | 0.385 |  |
| 2.90999999999964 | 0.586 | 0.385 |  |
| 2.904999999999641 | 0.587 | 0.385 |  |
| 2.899999999999641 | 0.587 | 0.385 |  |
| 2.894999999999641 | 0.588 | 0.385 |  |
| 2.889999999999641 | 0.588 | 0.385 |  |
| 2.884999999999641 | 0.589 | 0.385 |  |
| 2.879999999999641 | 0.589 | 0.385 |  |
| 2.874999999999641 | 0.59 | 0.385 |  |
| 2.869999999999641 | 0.59 | 0.385 |  |
| 2.864999999999641 | 0.591 | 0.385 |  |
| 2.859999999999641 | 0.591 | 0.385 |  |
| 2.854999999999642 | 0.592 | 0.385 |  |
| 2.849999999999642 | 0.592 | 0.385 |  |
| 2.844999999999642 | 0.593 | 0.384 |  |
| 2.839999999999642 | 0.593 | 0.384 |  |
| 2.834999999999642 | 0.594 | 0.384 |  |
| 2.829999999999642 | 0.594 | 0.384 |  |
| 2.824999999999642 | 0.595 | 0.384 |  |
| 2.819999999999642 | 0.595 | 0.384 |  |
| 2.814999999999642 | 0.596 | 0.384 |  |
| 2.809999999999643 | 0.597 | 0.384 |  |
| 2.804999999999643 | 0.597 | 0.384 |  |
| 2.799999999999643 | 0.598 | 0.384 |  |
| 2.794999999999643 | 0.598 | 0.384 |  |
| 2.789999999999643 | 0.599 | 0.384 |  |
| 2.784999999999643 | 0.599 | 0.384 |  |
| 2.779999999999643 | 0.6 | 0.384 |  |
| 2.774999999999643 | 0.6 | 0.384 |  |
| 2.769999999999643 | 0.601 | 0.384 |  |
| 2.764999999999643 | 0.601 | 0.384 |  |
| 2.759999999999644 | 0.602 | 0.384 |  |
| 2.754999999999644 | 0.602 | 0.384 |  |
| 2.749999999999644 | 0.603 | 0.384 |  |
| 2.744999999999644 | 0.604 | 0.384 |  |
| 2.739999999999644 | 0.604 | 0.384 |  |
| 2.734999999999644 | 0.605 | 0.384 |  |
| 2.729999999999644 | 0.605 | 0.384 |  |
| 2.724999999999644 | 0.606 | 0.383 |  |
| 2.719999999999644 | 0.606 | 0.383 |  |
| 2.714999999999645 | 0.607 | 0.383 |  |
| 2.709999999999645 | 0.607 | 0.383 |  |
| 2.704999999999645 | 0.608 | 0.383 |  |
| 2.699999999999645 | 0.609 | 0.383 |  |
| 2.694999999999645 | 0.609 | 0.383 |  |
| 2.689999999999645 | 0.61 | 0.383 |  |
| 2.684999999999645 | 0.61 | 0.383 |  |
| 2.679999999999645 | 0.611 | 0.383 |  |
| 2.674999999999645 | 0.611 | 0.383 |  |
| 2.669999999999645 | 0.612 | 0.383 |  |
| 2.664999999999646 | 0.613 | 0.383 |  |
| 2.659999999999646 | 0.613 | 0.383 |  |
| 2.654999999999646 | 0.614 | 0.383 |  |
| 2.649999999999646 | 0.614 | 0.382 |  |
| 2.644999999999646 | 0.615 | 0.382 |  |
| 2.639999999999646 | 0.615 | 0.382 |  |
| 2.634999999999646 | 0.616 | 0.382 |  |
| 2.629999999999646 | 0.617 | 0.382 |  |
| 2.624999999999646 | 0.617 | 0.382 |  |
| 2.619999999999647 | 0.618 | 0.382 |  |
| 2.614999999999647 | 0.618 | 0.382 |  |
| 2.609999999999647 | 0.619 | 0.382 |  |
| 2.604999999999647 | 0.62 | 0.382 |  |
| 2.599999999999647 | 0.62 | 0.382 |  |
| 2.594999999999647 | 0.621 | 0.382 |  |
| 2.589999999999647 | 0.621 | 0.381 |  |
| 2.584999999999647 | 0.622 | 0.381 |  |
| 2.579999999999647 | 0.623 | 0.381 |  |
| 2.574999999999648 | 0.623 | 0.381 |  |
| 2.569999999999648 | 0.624 | 0.381 |  |
| 2.564999999999648 | 0.624 | 0.381 |  |
| 2.559999999999648 | 0.625 | 0.381 |  |
| 2.554999999999648 | 0.626 | 0.381 |  |
| 2.549999999999648 | 0.626 | 0.381 |  |
| 2.544999999999648 | 0.627 | 0.381 |  |
| 2.539999999999648 | 0.627 | 0.38 |  |
| 2.534999999999648 | 0.628 | 0.38 |  |
| 2.529999999999649 | 0.629 | 0.38 |  |
| 2.524999999999649 | 0.629 | 0.38 |  |
| 2.519999999999649 | 0.63 | 0.38 |  |
| 2.514999999999649 | 0.631 | 0.38 |  |
| 2.509999999999649 | 0.631 | 0.38 |  |
| 2.504999999999649 | 0.632 | 0.38 |  |
| 2.499999999999649 | 0.632 | 0.379 |  |
| 2.494999999999649 | 0.633 | 0.379 |  |
| 2.489999999999649 | 0.634 | 0.379 |  |
| 2.484999999999649 | 0.634 | 0.379 |  |
| 2.47999999999965 | 0.635 | 0.379 |  |
| 2.47499999999965 | 0.636 | 0.379 |  |
| 2.46999999999965 | 0.636 | 0.379 |  |
| 2.46499999999965 | 0.637 | 0.379 |  |
| 2.45999999999965 | 0.638 | 0.378 |  |
| 2.45499999999965 | 0.638 | 0.378 |  |
| 2.44999999999965 | 0.639 | 0.378 |  |
| 2.44499999999965 | 0.64 | 0.378 |  |
| 2.43999999999965 | 0.64 | 0.378 |  |
| 2.434999999999651 | 0.641 | 0.378 |  |
| 2.429999999999651 | 0.642 | 0.378 |  |
| 2.424999999999651 | 0.642 | 0.377 |  |
| 2.419999999999651 | 0.643 | 0.377 |  |
| 2.414999999999651 | 0.643 | 0.377 |  |
| 2.409999999999651 | 0.644 | 0.377 |  |
| 2.404999999999651 | 0.645 | 0.377 |  |
| 2.399999999999651 | 0.645 | 0.377 |  |
| 2.394999999999651 | 0.646 | 0.376 |  |
| 2.389999999999651 | 0.647 | 0.376 |  |
| 2.384999999999652 | 0.648 | 0.376 |  |
| 2.379999999999652 | 0.648 | 0.376 |  |
| 2.374999999999652 | 0.649 | 0.376 |  |
| 2.369999999999652 | 0.65 | 0.375 |  |
| 2.364999999999652 | 0.65 | 0.375 |  |
| 2.359999999999652 | 0.651 | 0.375 |  |
| 2.354999999999652 | 0.652 | 0.375 |  |
| 2.349999999999652 | 0.652 | 0.375 |  |
| 2.344999999999652 | 0.653 | 0.375 |  |
| 2.339999999999653 | 0.654 | 0.374 |  |
| 2.334999999999653 | 0.654 | 0.374 |  |
| 2.329999999999653 | 0.655 | 0.374 |  |
| 2.324999999999653 | 0.656 | 0.374 |  |
| 2.319999999999653 | 0.657 | 0.374 |  |
| 2.314999999999653 | 0.657 | 0.373 |  |
| 2.309999999999653 | 0.658 | 0.373 |  |
| 2.304999999999653 | 0.659 | 0.373 |  |
| 2.299999999999653 | 0.659 | 0.373 |  |
| 2.294999999999654 | 0.66 | 0.372 |  |
| 2.289999999999654 | 0.661 | 0.372 |  |
| 2.284999999999654 | 0.662 | 0.372 |  |
| 2.279999999999654 | 0.662 | 0.372 |  |
| 2.274999999999654 | 0.663 | 0.372 |  |
| 2.269999999999654 | 0.664 | 0.371 |  |
| 2.264999999999654 | 0.664 | 0.371 |  |
| 2.259999999999654 | 0.665 | 0.371 |  |
| 2.254999999999654 | 0.666 | 0.371 |  |
| 2.249999999999654 | 0.667 | 0.37 |  |
| 2.244999999999655 | 0.667 | 0.37 |  |
| 2.239999999999655 | 0.668 | 0.37 |  |
| 2.234999999999655 | 0.669 | 0.37 |  |
| 2.229999999999655 | 0.67 | 0.369 |  |
| 2.224999999999655 | 0.67 | 0.369 |  |
| 2.219999999999655 | 0.671 | 0.369 |  |
| 2.214999999999655 | 0.672 | 0.369 |  |
| 2.209999999999655 | 0.673 | 0.368 |  |
| 2.204999999999655 | 0.673 | 0.368 |  |
| 2.199999999999656 | 0.674 | 0.368 |  |
| 2.194999999999656 | 0.675 | 0.367 |  |
| 2.189999999999656 | 0.676 | 0.367 |  |
| 2.184999999999656 | 0.677 | 0.367 |  |
| 2.179999999999656 | 0.677 | 0.367 |  |
| 2.174999999999656 | 0.678 | 0.366 |  |
| 2.169999999999656 | 0.679 | 0.366 |  |
| 2.164999999999656 | 0.68 | 0.366 |  |
| 2.159999999999656 | 0.68 | 0.365 |  |
| 2.154999999999657 | 0.681 | 0.365 |  |
| 2.149999999999657 | 0.682 | 0.365 |  |
| 2.144999999999657 | 0.683 | 0.364 |  |
| 2.139999999999657 | 0.684 | 0.364 |  |
| 2.134999999999657 | 0.684 | 0.364 |  |
| 2.129999999999657 | 0.685 | 0.364 |  |
| 2.124999999999657 | 0.686 | 0.363 |  |
| 2.119999999999657 | 0.687 | 0.363 |  |
| 2.114999999999657 | 0.688 | 0.363 |  |
| 2.109999999999657 | 0.688 | 0.362 |  |
| 2.104999999999658 | 0.689 | 0.362 |  |
| 2.099999999999658 | 0.69 | 0.361 |  |
| 2.094999999999658 | 0.691 | 0.361 |  |
| 2.089999999999658 | 0.692 | 0.361 |  |
| 2.084999999999658 | 0.693 | 0.36 |  |
| 2.079999999999658 | 0.693 | 0.36 |  |
| 2.074999999999658 | 0.694 | 0.36 |  |
| 2.069999999999658 | 0.695 | 0.359 |  |
| 2.064999999999658 | 0.696 | 0.359 |  |
| 2.059999999999659 | 0.697 | 0.359 |  |
| 2.054999999999659 | 0.698 | 0.358 |  |
| 2.049999999999659 | 0.698 | 0.358 |  |
| 2.044999999999659 | 0.699 | 0.357 |  |
| 2.039999999999659 | 0.7 | 0.357 |  |
| 2.034999999999659 | 0.701 | 0.357 |  |
| 2.029999999999659 | 0.702 | 0.356 |  |
| 2.024999999999659 | 0.703 | 0.356 |  |
| 2.019999999999659 | 0.704 | 0.355 |  |
| 2.01499999999966 | 0.704 | 0.355 |  |
| 2.00999999999966 | 0.705 | 0.354 |  |
| 2.00499999999966 | 0.706 | 0.354 |  |
| 1.99999999999966 | 0.707 | 0.354 |  |
| 1.99499999999966 | 0.708 | 0.353 |  |
| 1.98999999999966 | 0.709 | 0.353 |  |
| 1.98499999999966 | 0.71 | 0.352 |  |
| 1.97999999999966 | 0.711 | 0.352 |  |
| 1.97499999999966 | 0.712 | 0.351 |  |
| 1.96999999999966 | 0.712 | 0.351 |  |
| 1.964999999999661 | 0.713 | 0.35 |  |
| 1.959999999999661 | 0.714 | 0.35 |  |
| 1.954999999999661 | 0.715 | 0.349 |  |
| 1.949999999999661 | 0.716 | 0.349 |  |
| 1.944999999999661 | 0.717 | 0.348 |  |
| 1.939999999999661 | 0.718 | 0.348 |  |
| 1.934999999999661 | 0.719 | 0.347 |  |
| 1.929999999999661 | 0.72 | 0.347 |  |
| 1.924999999999661 | 0.721 | 0.346 |  |
| 1.919999999999662 | 0.722 | 0.346 |  |
| 1.914999999999662 | 0.723 | 0.345 |  |
| 1.909999999999662 | 0.724 | 0.345 |  |
| 1.904999999999662 | 0.725 | 0.344 |  |
| 1.899999999999662 | 0.725 | 0.344 |  |
| 1.894999999999662 | 0.726 | 0.343 |  |
| 1.889999999999662 | 0.727 | 0.343 |  |
| 1.884999999999662 | 0.728 | 0.342 |  |
| 1.879999999999662 | 0.729 | 0.341 |  |
| 1.874999999999662 | 0.73 | 0.341 |  |
| 1.869999999999663 | 0.731 | 0.34 |  |
| 1.864999999999663 | 0.732 | 0.34 |  |
| 1.859999999999663 | 0.733 | 0.339 |  |
| 1.854999999999663 | 0.734 | 0.338 |  |
| 1.849999999999663 | 0.735 | 0.338 |  |
| 1.844999999999663 | 0.736 | 0.337 |  |
| 1.839999999999663 | 0.737 | 0.337 |  |
| 1.834999999999663 | 0.738 | 0.336 |  |
| 1.829999999999663 | 0.739 | 0.335 |  |
| 1.824999999999664 | 0.74 | 0.335 |  |
| 1.819999999999664 | 0.741 | 0.334 |  |
| 1.814999999999664 | 0.742 | 0.333 |  |
| 1.809999999999664 | 0.743 | 0.333 |  |
| 1.804999999999664 | 0.744 | 0.332 |  |
| 1.799999999999664 | 0.745 | 0.331 |  |
| 1.794999999999664 | 0.746 | 0.331 |  |
| 1.789999999999664 | 0.747 | 0.33 |  |
| 1.784999999999664 | 0.748 | 0.329 |  |
| 1.779999999999664 | 0.75 | 0.328 |  |
| 1.774999999999665 | 0.751 | 0.328 |  |
| 1.769999999999665 | 0.752 | 0.327 |  |
| 1.764999999999665 | 0.753 | 0.326 |  |
| 1.759999999999665 | 0.754 | 0.325 |  |
| 1.754999999999665 | 0.755 | 0.325 |  |
| 1.749999999999665 | 0.756 | 0.324 |  |
| 1.744999999999665 | 0.757 | 0.323 |  |
| 1.739999999999665 | 0.758 | 0.322 |  |
| 1.734999999999665 | 0.759 | 0.322 |  |
| 1.729999999999666 | 0.76 | 0.321 |  |
| 1.724999999999666 | 0.761 | 0.32 |  |
| 1.719999999999666 | 0.762 | 0.319 |  |
| 1.714999999999666 | 0.764 | 0.318 |  |
| 1.709999999999666 | 0.765 | 0.318 |  |
| 1.704999999999666 | 0.766 | 0.317 |  |
| 1.699999999999666 | 0.767 | 0.316 |  |
| 1.694999999999666 | 0.768 | 0.315 |  |
| 1.689999999999666 | 0.769 | 0.314 |  |
| 1.684999999999666 | 0.77 | 0.313 |  |
| 1.679999999999667 | 0.772 | 0.312 |  |
| 1.674999999999667 | 0.773 | 0.311 |  |
| 1.669999999999667 | 0.774 | 0.31 |  |
| 1.664999999999667 | 0.775 | 0.31 |  |
| 1.659999999999667 | 0.776 | 0.309 |  |
| 1.654999999999667 | 0.777 | 0.308 |  |
| 1.649999999999667 | 0.778 | 0.307 |  |
| 1.644999999999667 | 0.78 | 0.306 |  |
| 1.639999999999667 | 0.781 | 0.305 |  |
| 1.634999999999668 | 0.782 | 0.304 |  |
| 1.629999999999668 | 0.783 | 0.303 |  |
| 1.624999999999668 | 0.784 | 0.302 |  |
| 1.619999999999668 | 0.786 | 0.301 |  |
| 1.614999999999668 | 0.787 | 0.3 |  |
| 1.609999999999668 | 0.788 | 0.299 |  |
| 1.604999999999668 | 0.789 | 0.298 |  |
| 1.599999999999668 | 0.791 | 0.296 |  |
| 1.594999999999668 | 0.792 | 0.295 |  |
| 1.589999999999669 | 0.793 | 0.294 |  |
| 1.584999999999669 | 0.794 | 0.293 |  |
| 1.579999999999669 | 0.796 | 0.292 |  |
| 1.574999999999669 | 0.797 | 0.291 |  |
| 1.569999999999669 | 0.798 | 0.29 |  |
| 1.564999999999669 | 0.799 | 0.289 |  |
| 1.559999999999669 | 0.801 | 0.287 |  |
| 1.554999999999669 | 0.802 | 0.286 |  |
| 1.549999999999669 | 0.803 | 0.285 |  |
| 1.54499999999967 | 0.805 | 0.284 |  |
| 1.53999999999967 | 0.806 | 0.283 |  |
| 1.53499999999967 | 0.807 | 0.281 |  |
| 1.52999999999967 | 0.808 | 0.28 |  |
| 1.52499999999967 | 0.81 | 0.279 |  |
| 1.51999999999967 | 0.811 | 0.277 |  |
| 1.51499999999967 | 0.812 | 0.276 |  |
| 1.50999999999967 | 0.814 | 0.275 |  |
| 1.50499999999967 | 0.815 | 0.274 |  |
| 1.49999999999967 | 0.816 | 0.272 |  |
| 1.494999999999671 | 0.818 | 0.271 |  |
| 1.489999999999671 | 0.819 | 0.269 |  |
| 1.484999999999671 | 0.821 | 0.268 |  |
| 1.479999999999671 | 0.822 | 0.267 |  |
| 1.474999999999671 | 0.823 | 0.265 |  |
| 1.469999999999671 | 0.825 | 0.264 |  |
| 1.464999999999671 | 0.826 | 0.262 |  |
| 1.459999999999671 | 0.828 | 0.261 |  |
| 1.454999999999671 | 0.829 | 0.259 |  |
| 1.449999999999672 | 0.83 | 0.258 |  |
| 1.444999999999672 | 0.832 | 0.256 |  |
| 1.439999999999672 | 0.833 | 0.255 |  |
| 1.434999999999672 | 0.835 | 0.253 |  |
| 1.429999999999672 | 0.836 | 0.251 |  |
| 1.424999999999672 | 0.838 | 0.25 |  |
| 1.419999999999672 | 0.839 | 0.248 |  |
| 1.414999999999672 | 0.841 | 0.247 |  |
| 1.409999999999672 | 0.842 | 0.245 |  |
| 1.404999999999672 | 0.844 | 0.243 |  |
| 1.399999999999673 | 0.845 | 0.241 |  |
| 1.394999999999673 | 0.847 | 0.24 |  |
| 1.389999999999673 | 0.848 | 0.238 |  |
| 1.384999999999673 | 0.85 | 0.236 |  |
| 1.379999999999673 | 0.851 | 0.234 |  |
| 1.374999999999673 | 0.853 | 0.233 |  |
| 1.369999999999673 | 0.854 | 0.231 |  |
| 1.364999999999673 | 0.856 | 0.229 |  |
| 1.359999999999673 | 0.857 | 0.227 |  |
| 1.354999999999674 | 0.859 | 0.225 |  |
| 1.349999999999674 | 0.861 | 0.223 |  |
| 1.344999999999674 | 0.862 | 0.221 |  |
| 1.339999999999674 | 0.864 | 0.219 |  |
| 1.334999999999674 | 0.865 | 0.217 |  |
| 1.329999999999674 | 0.867 | 0.215 |  |
| 1.324999999999674 | 0.869 | 0.213 |  |
| 1.319999999999674 | 0.87 | 0.211 |  |
| 1.314999999999674 | 0.872 | 0.209 |  |
| 1.309999999999674 | 0.874 | 0.207 |  |
| 1.304999999999675 | 0.875 | 0.205 |  |
| 1.299999999999675 | 0.877 | 0.202 |  |
| 1.294999999999675 | 0.879 | 0.2 |  |
| 1.289999999999675 | 0.88 | 0.198 |  |
| 1.284999999999675 | 0.882 | 0.196 |  |
| 1.279999999999675 | 0.884 | 0.193 |  |
| 1.274999999999675 | 0.886 | 0.191 |  |
| 1.269999999999675 | 0.887 | 0.189 |  |
| 1.264999999999675 | 0.889 | 0.186 |  |
| 1.259999999999676 | 0.891 | 0.184 |  |
| 1.254999999999676 | 0.893 | 0.181 |  |
| 1.249999999999676 | 0.894 | 0.179 |  |
| 1.244999999999676 | 0.896 | 0.176 |  |
| 1.239999999999676 | 0.898 | 0.174 |  |
| 1.234999999999676 | 0.9 | 0.171 |  |
| 1.229999999999676 | 0.902 | 0.169 |  |
| 1.224999999999676 | 0.904 | 0.166 |  |
| 1.219999999999676 | 0.905 | 0.163 |  |
| 1.214999999999677 | 0.907 | 0.161 |  |
| 1.209999999999677 | 0.909 | 0.158 |  |
| 1.204999999999677 | 0.911 | 0.155 |  |
| 1.199999999999677 | 0.913 | 0.152 |  |
| 1.194999999999677 | 0.915 | 0.149 |  |
| 1.189999999999677 | 0.917 | 0.146 |  |
| 1.184999999999677 | 0.919 | 0.143 |  |
| 1.179999999999677 | 0.921 | 0.14 |  |
| 1.174999999999677 | 0.923 | 0.137 |  |
| 1.169999999999677 | 0.925 | 0.134 |  |
| 1.164999999999678 | 0.926 | 0.131 |  |
| 1.159999999999678 | 0.928 | 0.128 |  |
| 1.154999999999678 | 0.93 | 0.125 |  |
| 1.149999999999678 | 0.933 | 0.122 |  |
| 1.144999999999678 | 0.935 | 0.118 |  |
| 1.139999999999678 | 0.937 | 0.115 |  |
| 1.134999999999678 | 0.939 | 0.112 |  |
| 1.129999999999678 | 0.941 | 0.108 |  |
| 1.124999999999678 | 0.943 | 0.105 |  |
| 1.119999999999679 | 0.945 | 0.101 |  |
| 1.114999999999679 | 0.947 | 0.098 |  |
| 1.109999999999679 | 0.949 | 0.094 |  |
| 1.104999999999679 | 0.951 | 0.09 |  |
| 1.099999999999679 | 0.953 | 0.087 |  |
| 1.094999999999679 | 0.956 | 0.083 |  |
| 1.089999999999679 | 0.958 | 0.079 |  |
| 1.084999999999679 | 0.96 | 0.075 |  |
| 1.079999999999679 | 0.962 | 0.071 |  |
| 1.07499999999968 | 0.964 | 0.067 |  |
| 1.06999999999968 | 0.967 | 0.063 |  |
| 1.06499999999968 | 0.969 | 0.059 |  |
| 1.05999999999968 | 0.971 | 0.055 |  |
| 1.05499999999968 | 0.974 | 0.051 |  |
| 1.04999999999968 | 0.976 | 0.046 |  |
| 1.04499999999968 | 0.978 | 0.042 |  |
| 1.03999999999968 | 0.981 | 0.038 |  |
| 1.03499999999968 | 0.983 | 0.033 |  |
| 1.02999999999968 | 0.985 | 0.029 |  |
| 1.024999999999681 | 0.988 | 0.024 |  |
| 1.019999999999681 | 0.99 | 0.019 |  |
| 1.014999999999681 | 0.993 | 0.015 |  |
| 1.009999999999681 | 0.995 | 0.01 |  |
| 1.004999999999681 | 0.998 | 0.005 |  |
| 0.999999999999681 | 1 | 0 |  |